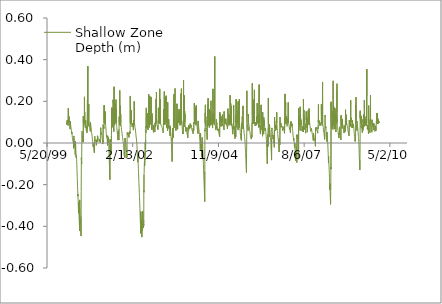
| Category | Shallow Zone Depth (m) |
|---|---|
| 36526.0 | 0.1 |
| 36527.0 | 0.097 |
| 36528.0 | 0.095 |
| 36529.0 | 0.092 |
| 36530.0 | 0.091 |
| 36531.0 | 0.089 |
| 36532.0 | 0.087 |
| 36533.0 | 0.095 |
| 36534.0 | 0.093 |
| 36535.0 | 0.09 |
| 36536.0 | 0.109 |
| 36537.0 | 0.101 |
| 36538.0 | 0.098 |
| 36539.0 | 0.098 |
| 36540.0 | 0.095 |
| 36541.0 | 0.093 |
| 36542.0 | 0.091 |
| 36543.0 | 0.089 |
| 36544.0 | 0.086 |
| 36545.0 | 0.086 |
| 36546.0 | 0.084 |
| 36547.0 | 0.082 |
| 36548.0 | 0.08 |
| 36549.0 | 0.167 |
| 36550.0 | 0.149 |
| 36551.0 | 0.109 |
| 36552.0 | 0.108 |
| 36553.0 | 0.101 |
| 36554.0 | 0.117 |
| 36555.0 | 0.099 |
| 36556.0 | 0.128 |
| 36557.0 | 0.105 |
| 36558.0 | 0.1 |
| 36559.0 | 0.098 |
| 36560.0 | 0.095 |
| 36561.0 | 0.092 |
| 36562.0 | 0.09 |
| 36563.0 | 0.087 |
| 36564.0 | 0.084 |
| 36565.0 | 0.082 |
| 36566.0 | 0.079 |
| 36567.0 | 0.076 |
| 36568.0 | 0.073 |
| 36569.0 | 0.07 |
| 36570.0 | 0.067 |
| 36571.0 | 0.105 |
| 36572.0 | 0.099 |
| 36573.0 | 0.095 |
| 36574.0 | 0.092 |
| 36575.0 | 0.088 |
| 36576.0 | 0.085 |
| 36577.0 | 0.082 |
| 36578.0 | 0.079 |
| 36579.0 | 0.076 |
| 36580.0 | 0.073 |
| 36581.0 | 0.07 |
| 36582.0 | 0.066 |
| 36583.0 | 0.063 |
| 36584.0 | 0.064 |
| 36585.0 | 0.061 |
| 36586.0 | 0.057 |
| 36587.0 | 0.053 |
| 36588.0 | 0.049 |
| 36589.0 | 0.045 |
| 36590.0 | 0.052 |
| 36591.0 | 0.049 |
| 36592.0 | 0.044 |
| 36593.0 | 0.04 |
| 36594.0 | 0.035 |
| 36595.0 | 0.031 |
| 36596.0 | 0.027 |
| 36597.0 | 0.024 |
| 36598.0 | 0.024 |
| 36599.0 | 0.02 |
| 36600.0 | 0.016 |
| 36601.0 | 0.011 |
| 36602.0 | 0.013 |
| 36603.0 | 0.009 |
| 36604.0 | 0.007 |
| 36605.0 | 0.009 |
| 36606.0 | 0.008 |
| 36607.0 | 0.004 |
| 36608.0 | -0.001 |
| 36609.0 | -0.008 |
| 36610.0 | -0.016 |
| 36611.0 | -0.026 |
| 36612.0 | 0.022 |
| 36613.0 | 0.034 |
| 36614.0 | 0.032 |
| 36615.0 | 0.027 |
| 36616.0 | 0.024 |
| 36617.0 | 0.02 |
| 36618.0 | 0.016 |
| 36619.0 | 0.011 |
| 36620.0 | 0.007 |
| 36621.0 | 0.007 |
| 36622.0 | 0.002 |
| 36623.0 | -0.005 |
| 36624.0 | -0.016 |
| 36625.0 | -0.006 |
| 36626.0 | -0.014 |
| 36627.0 | -0.025 |
| 36628.0 | -0.036 |
| 36629.0 | -0.046 |
| 36630.0 | -0.057 |
| 36631.0 | 0.009 |
| 36632.0 | 0.008 |
| 36633.0 | 0.002 |
| 36634.0 | -0.005 |
| 36635.0 | -0.015 |
| 36636.0 | -0.026 |
| 36637.0 | -0.037 |
| 36638.0 | -0.047 |
| 36639.0 | -0.056 |
| 36640.0 | -0.067 |
| 36641.0 | -0.06 |
| 36642.0 | -0.069 |
| 36643.0 | -0.061 |
| 36644.0 | -0.072 |
| 36645.0 | -0.068 |
| 36646.0 | -0.078 |
| 36647.0 | -0.09 |
| 36648.0 | -0.103 |
| 36649.0 | -0.116 |
| 36650.0 | -0.128 |
| 36651.0 | -0.14 |
| 36652.0 | -0.152 |
| 36653.0 | -0.164 |
| 36654.0 | -0.177 |
| 36655.0 | -0.191 |
| 36656.0 | -0.204 |
| 36657.0 | -0.215 |
| 36658.0 | -0.228 |
| 36659.0 | -0.241 |
| 36660.0 | -0.254 |
| 36661.0 | -0.245 |
| 36662.0 | -0.258 |
| 36663.0 | -0.269 |
| 36664.0 | -0.283 |
| 36665.0 | -0.296 |
| 36666.0 | -0.311 |
| 36667.0 | -0.324 |
| 36668.0 | -0.337 |
| 36669.0 | -0.285 |
| 36670.0 | -0.297 |
| 36671.0 | -0.308 |
| 36672.0 | -0.32 |
| 36673.0 | -0.332 |
| 36674.0 | -0.346 |
| 36675.0 | -0.359 |
| 36676.0 | -0.37 |
| 36677.0 | -0.381 |
| 36678.0 | -0.393 |
| 36679.0 | -0.408 |
| 36680.0 | -0.422 |
| 36681.0 | -0.273 |
| 36682.0 | -0.287 |
| 36683.0 | -0.3 |
| 36684.0 | -0.31 |
| 36685.0 | -0.322 |
| 36686.0 | -0.335 |
| 36687.0 | -0.348 |
| 36688.0 | -0.361 |
| 36689.0 | -0.365 |
| 36690.0 | -0.367 |
| 36691.0 | -0.378 |
| 36692.0 | -0.389 |
| 36693.0 | -0.4 |
| 36694.0 | -0.412 |
| 36695.0 | -0.422 |
| 36696.0 | -0.433 |
| 36697.0 | -0.447 |
| 36698.0 | -0.352 |
| 36699.0 | -0.232 |
| 36700.0 | -0.145 |
| 36701.0 | -0.071 |
| 36702.0 | -0.081 |
| 36703.0 | -0.093 |
| 36704.0 | -0.101 |
| 36705.0 | -0.09 |
| 36706.0 | 0 |
| 36707.0 | 0.021 |
| 36708.0 | 0.056 |
| 36709.0 | 0.05 |
| 36710.0 | 0.044 |
| 36711.0 | 0.038 |
| 36712.0 | 0.032 |
| 36713.0 | 0.025 |
| 36714.0 | 0.018 |
| 36715.0 | 0.031 |
| 36716.0 | 0.025 |
| 36717.0 | 0.019 |
| 36718.0 | 0.012 |
| 36719.0 | 0.005 |
| 36720.0 | 0.016 |
| 36721.0 | 0.011 |
| 36722.0 | 0.007 |
| 36723.0 | 0.004 |
| 36724.0 | 0.129 |
| 36725.0 | 0.096 |
| 36726.0 | 0.09 |
| 36727.0 | 0.083 |
| 36728.0 | 0.091 |
| 36729.0 | 0.087 |
| 36730.0 | 0.119 |
| 36731.0 | 0.1 |
| 36732.0 | 0.098 |
| 36733.0 | 0.116 |
| 36734.0 | 0.096 |
| 36735.0 | 0.102 |
| 36736.0 | 0.097 |
| 36737.0 | 0.222 |
| 36738.0 | 0.095 |
| 36739.0 | 0.1 |
| 36740.0 | 0.149 |
| 36741.0 | 0.095 |
| 36742.0 | 0.099 |
| 36743.0 | 0.096 |
| 36744.0 | 0.09 |
| 36745.0 | 0.086 |
| 36746.0 | 0.08 |
| 36747.0 | 0.074 |
| 36748.0 | 0.094 |
| 36749.0 | 0.089 |
| 36750.0 | 0.084 |
| 36751.0 | 0.108 |
| 36752.0 | 0.097 |
| 36753.0 | 0.092 |
| 36754.0 | 0.085 |
| 36755.0 | 0.079 |
| 36756.0 | 0.073 |
| 36757.0 | 0.067 |
| 36758.0 | 0.068 |
| 36759.0 | 0.063 |
| 36760.0 | 0.058 |
| 36761.0 | 0.08 |
| 36762.0 | 0.074 |
| 36763.0 | 0.068 |
| 36764.0 | 0.066 |
| 36765.0 | 0.06 |
| 36766.0 | 0.054 |
| 36767.0 | 0.049 |
| 36768.0 | 0.078 |
| 36769.0 | 0.076 |
| 36770.0 | 0.07 |
| 36771.0 | 0.069 |
| 36772.0 | 0.208 |
| 36773.0 | 0.107 |
| 36774.0 | 0.1 |
| 36775.0 | 0.104 |
| 36776.0 | 0.369 |
| 36777.0 | 0.096 |
| 36778.0 | 0.104 |
| 36779.0 | 0.108 |
| 36780.0 | 0.099 |
| 36781.0 | 0.095 |
| 36782.0 | 0.09 |
| 36783.0 | 0.085 |
| 36784.0 | 0.08 |
| 36785.0 | 0.078 |
| 36786.0 | 0.083 |
| 36787.0 | 0.187 |
| 36788.0 | 0.098 |
| 36789.0 | 0.094 |
| 36790.0 | 0.1 |
| 36791.0 | 0.096 |
| 36792.0 | 0.094 |
| 36793.0 | 0.091 |
| 36794.0 | 0.088 |
| 36795.0 | 0.088 |
| 36796.0 | 0.085 |
| 36797.0 | 0.082 |
| 36798.0 | 0.078 |
| 36799.0 | 0.079 |
| 36800.0 | 0.075 |
| 36801.0 | 0.072 |
| 36802.0 | 0.068 |
| 36803.0 | 0.064 |
| 36804.0 | 0.06 |
| 36805.0 | 0.056 |
| 36806.0 | 0.101 |
| 36807.0 | 0.098 |
| 36808.0 | 0.095 |
| 36809.0 | 0.092 |
| 36810.0 | 0.089 |
| 36811.0 | 0.086 |
| 36812.0 | 0.082 |
| 36813.0 | 0.079 |
| 36814.0 | 0.075 |
| 36815.0 | 0.071 |
| 36816.0 | 0.067 |
| 36817.0 | 0.063 |
| 36818.0 | 0.059 |
| 36819.0 | 0.055 |
| 36820.0 | 0.052 |
| 36821.0 | 0.049 |
| 36822.0 | 0.045 |
| 36823.0 | 0.042 |
| 36824.0 | 0.041 |
| 36825.0 | 0.037 |
| 36826.0 | 0.034 |
| 36827.0 | 0.03 |
| 36828.0 | 0.026 |
| 36829.0 | 0.022 |
| 36830.0 | 0.019 |
| 36831.0 | 0.015 |
| 36832.0 | 0.012 |
| 36833.0 | 0.009 |
| 36834.0 | 0.006 |
| 36835.0 | 0.002 |
| 36836.0 | -0.001 |
| 36837.0 | -0.007 |
| 36838.0 | -0.013 |
| 36839.0 | -0.018 |
| 36840.0 | -0.001 |
| 36841.0 | -0.005 |
| 36842.0 | -0.01 |
| 36843.0 | -0.016 |
| 36844.0 | -0.022 |
| 36845.0 | -0.026 |
| 36846.0 | -0.031 |
| 36847.0 | -0.037 |
| 36848.0 | -0.042 |
| 36849.0 | -0.045 |
| 36850.0 | -0.037 |
| 36851.0 | -0.04 |
| 36852.0 | -0.043 |
| 36853.0 | -0.047 |
| 36854.0 | -0.052 |
| 36855.0 | -0.007 |
| 36856.0 | 0.023 |
| 36857.0 | 0.032 |
| 36858.0 | 0.03 |
| 36859.0 | 0.027 |
| 36860.0 | 0.025 |
| 36861.0 | 0.023 |
| 36862.0 | 0.02 |
| 36863.0 | 0.018 |
| 36864.0 | 0.016 |
| 36865.0 | 0.015 |
| 36866.0 | 0.013 |
| 36867.0 | 0.011 |
| 36868.0 | 0.009 |
| 36869.0 | 0.006 |
| 36870.0 | 0.004 |
| 36871.0 | 0.002 |
| 36872.0 | 0.004 |
| 36873.0 | 0.002 |
| 36874.0 | -0.002 |
| 36875.0 | -0.006 |
| 36876.0 | -0.011 |
| 36877.0 | 0.016 |
| 36878.0 | 0.019 |
| 36879.0 | 0.018 |
| 36880.0 | 0.019 |
| 36881.0 | 0.018 |
| 36882.0 | 0.016 |
| 36883.0 | 0.014 |
| 36884.0 | 0.012 |
| 36885.0 | 0.011 |
| 36886.0 | 0.009 |
| 36887.0 | 0.007 |
| 36888.0 | 0.005 |
| 36889.0 | 0.035 |
| 36890.0 | 0.033 |
| 36891.0 | 0.032 |
| 36892.0 | 0.031 |
| 36893.0 | 0.03 |
| 36894.0 | 0.028 |
| 36895.0 | 0.027 |
| 36896.0 | 0.025 |
| 36897.0 | 0.023 |
| 36898.0 | 0.021 |
| 36899.0 | 0.019 |
| 36900.0 | 0.019 |
| 36901.0 | 0.018 |
| 36902.0 | 0.016 |
| 36903.0 | 0.016 |
| 36904.0 | 0.021 |
| 36905.0 | 0.019 |
| 36906.0 | 0.017 |
| 36907.0 | 0.014 |
| 36908.0 | 0.011 |
| 36909.0 | 0.009 |
| 36910.0 | 0.007 |
| 36911.0 | 0.004 |
| 36912.0 | 0.019 |
| 36913.0 | 0.018 |
| 36914.0 | 0.016 |
| 36915.0 | 0.014 |
| 36916.0 | 0.012 |
| 36917.0 | 0.01 |
| 36918.0 | 0.008 |
| 36919.0 | 0.005 |
| 36920.0 | 0.002 |
| 36921.0 | -0.001 |
| 36922.0 | 0.014 |
| 36923.0 | 0.034 |
| 36924.0 | 0.043 |
| 36925.0 | 0.059 |
| 36926.0 | 0.057 |
| 36927.0 | 0.073 |
| 36928.0 | 0.071 |
| 36929.0 | 0.068 |
| 36930.0 | 0.065 |
| 36931.0 | 0.061 |
| 36932.0 | 0.058 |
| 36933.0 | 0.055 |
| 36934.0 | 0.052 |
| 36935.0 | 0.049 |
| 36936.0 | 0.046 |
| 36937.0 | 0.043 |
| 36938.0 | 0.04 |
| 36939.0 | 0.036 |
| 36940.0 | 0.033 |
| 36941.0 | 0.03 |
| 36942.0 | 0.027 |
| 36943.0 | 0.023 |
| 36944.0 | 0.019 |
| 36945.0 | 0.016 |
| 36946.0 | 0.014 |
| 36947.0 | 0.011 |
| 36948.0 | 0.008 |
| 36949.0 | 0.005 |
| 36950.0 | 0.001 |
| 36951.0 | -0.005 |
| 36952.0 | 0.012 |
| 36953.0 | 0.009 |
| 36954.0 | 0.006 |
| 36955.0 | 0.088 |
| 36956.0 | 0.085 |
| 36957.0 | 0.082 |
| 36958.0 | 0.079 |
| 36959.0 | 0.075 |
| 36960.0 | 0.08 |
| 36961.0 | 0.077 |
| 36962.0 | 0.073 |
| 36963.0 | 0.068 |
| 36964.0 | 0.085 |
| 36965.0 | 0.081 |
| 36966.0 | 0.181 |
| 36967.0 | 0.115 |
| 36968.0 | 0.098 |
| 36969.0 | 0.148 |
| 36970.0 | 0.182 |
| 36971.0 | 0.125 |
| 36972.0 | 0.098 |
| 36973.0 | 0.094 |
| 36974.0 | 0.09 |
| 36975.0 | 0.086 |
| 36976.0 | 0.113 |
| 36977.0 | 0.098 |
| 36978.0 | 0.095 |
| 36979.0 | 0.092 |
| 36980.0 | 0.151 |
| 36981.0 | 0.099 |
| 36982.0 | 0.095 |
| 36983.0 | 0.091 |
| 36984.0 | 0.086 |
| 36985.0 | 0.08 |
| 36986.0 | 0.076 |
| 36987.0 | 0.072 |
| 36988.0 | 0.066 |
| 36989.0 | 0.061 |
| 36990.0 | 0.055 |
| 36991.0 | 0.05 |
| 36992.0 | 0.045 |
| 36993.0 | 0.039 |
| 36994.0 | 0.033 |
| 36995.0 | 0.028 |
| 36996.0 | 0.03 |
| 36997.0 | 0.038 |
| 36998.0 | 0.034 |
| 36999.0 | 0.029 |
| 37000.0 | 0.026 |
| 37001.0 | 0.021 |
| 37002.0 | 0.016 |
| 37003.0 | 0.011 |
| 37004.0 | 0.005 |
| 37005.0 | -0.001 |
| 37006.0 | -0.012 |
| 37007.0 | 0.033 |
| 37008.0 | 0.029 |
| 37009.0 | 0.024 |
| 37010.0 | 0.018 |
| 37011.0 | 0.013 |
| 37012.0 | 0.009 |
| 37013.0 | 0.004 |
| 37014.0 | 0.027 |
| 37015.0 | 0.022 |
| 37016.0 | 0.017 |
| 37017.0 | 0.011 |
| 37018.0 | 0.005 |
| 37019.0 | 0.003 |
| 37020.0 | -0.003 |
| 37021.0 | -0.013 |
| 37022.0 | -0.024 |
| 37023.0 | -0.037 |
| 37024.0 | -0.048 |
| 37025.0 | -0.061 |
| 37026.0 | -0.074 |
| 37027.0 | -0.086 |
| 37028.0 | -0.1 |
| 37029.0 | -0.112 |
| 37030.0 | -0.125 |
| 37031.0 | -0.138 |
| 37032.0 | -0.149 |
| 37033.0 | -0.163 |
| 37034.0 | -0.176 |
| 37035.0 | 0.017 |
| 37036.0 | 0.01 |
| 37037.0 | 0.003 |
| 37038.0 | -0.007 |
| 37039.0 | -0.021 |
| 37040.0 | -0.025 |
| 37041.0 | -0.024 |
| 37042.0 | -0.007 |
| 37043.0 | -0.019 |
| 37044.0 | -0.018 |
| 37045.0 | -0.029 |
| 37046.0 | -0.042 |
| 37047.0 | -0.055 |
| 37048.0 | -0.001 |
| 37049.0 | 0.011 |
| 37050.0 | 0.006 |
| 37051.0 | 0.005 |
| 37052.0 | 0.036 |
| 37053.0 | 0.109 |
| 37054.0 | 0.143 |
| 37055.0 | 0.17 |
| 37056.0 | 0.095 |
| 37057.0 | 0.122 |
| 37058.0 | 0.094 |
| 37059.0 | 0.088 |
| 37060.0 | 0.081 |
| 37061.0 | 0.086 |
| 37062.0 | 0.079 |
| 37063.0 | 0.079 |
| 37064.0 | 0.076 |
| 37065.0 | 0.117 |
| 37066.0 | 0.169 |
| 37067.0 | 0.095 |
| 37068.0 | 0.089 |
| 37069.0 | 0.101 |
| 37070.0 | 0.207 |
| 37071.0 | 0.191 |
| 37072.0 | 0.133 |
| 37073.0 | 0.095 |
| 37074.0 | 0.09 |
| 37075.0 | 0.084 |
| 37076.0 | 0.078 |
| 37077.0 | 0.073 |
| 37078.0 | 0.067 |
| 37079.0 | 0.061 |
| 37080.0 | 0.055 |
| 37081.0 | 0.103 |
| 37082.0 | 0.096 |
| 37083.0 | 0.27 |
| 37084.0 | 0.128 |
| 37085.0 | 0.097 |
| 37086.0 | 0.137 |
| 37087.0 | 0.097 |
| 37088.0 | 0.092 |
| 37089.0 | 0.086 |
| 37090.0 | 0.096 |
| 37091.0 | 0.138 |
| 37092.0 | 0.095 |
| 37093.0 | 0.192 |
| 37094.0 | 0.096 |
| 37095.0 | 0.095 |
| 37096.0 | 0.102 |
| 37097.0 | 0.105 |
| 37098.0 | 0.098 |
| 37099.0 | 0.105 |
| 37100.0 | 0.114 |
| 37101.0 | 0.096 |
| 37102.0 | 0.136 |
| 37103.0 | 0.098 |
| 37104.0 | 0.172 |
| 37105.0 | 0.208 |
| 37106.0 | 0.099 |
| 37107.0 | 0.1 |
| 37108.0 | 0.096 |
| 37109.0 | 0.163 |
| 37110.0 | 0.095 |
| 37111.0 | 0.09 |
| 37112.0 | 0.085 |
| 37113.0 | 0.079 |
| 37114.0 | 0.074 |
| 37115.0 | 0.069 |
| 37116.0 | 0.068 |
| 37117.0 | 0.062 |
| 37118.0 | 0.059 |
| 37119.0 | 0.056 |
| 37120.0 | 0.05 |
| 37121.0 | 0.045 |
| 37122.0 | 0.039 |
| 37123.0 | 0.042 |
| 37124.0 | 0.037 |
| 37125.0 | 0.031 |
| 37126.0 | 0.026 |
| 37127.0 | 0.02 |
| 37128.0 | 0.014 |
| 37129.0 | 0.056 |
| 37130.0 | 0.051 |
| 37131.0 | 0.045 |
| 37132.0 | 0.039 |
| 37133.0 | 0.034 |
| 37134.0 | 0.028 |
| 37135.0 | 0.03 |
| 37136.0 | 0.025 |
| 37137.0 | 0.021 |
| 37138.0 | 0.018 |
| 37139.0 | 0.014 |
| 37140.0 | 0.067 |
| 37141.0 | 0.071 |
| 37142.0 | 0.127 |
| 37143.0 | 0.096 |
| 37144.0 | 0.092 |
| 37145.0 | 0.088 |
| 37146.0 | 0.095 |
| 37147.0 | 0.112 |
| 37148.0 | 0.126 |
| 37149.0 | 0.252 |
| 37150.0 | 0.144 |
| 37151.0 | 0.095 |
| 37152.0 | 0.091 |
| 37153.0 | 0.09 |
| 37154.0 | 0.086 |
| 37155.0 | 0.082 |
| 37156.0 | 0.079 |
| 37157.0 | 0.179 |
| 37158.0 | 0.097 |
| 37159.0 | 0.102 |
| 37160.0 | 0.139 |
| 37161.0 | 0.096 |
| 37162.0 | 0.093 |
| 37163.0 | 0.089 |
| 37164.0 | 0.085 |
| 37165.0 | 0.082 |
| 37166.0 | 0.078 |
| 37167.0 | 0.074 |
| 37168.0 | 0.07 |
| 37169.0 | 0.066 |
| 37170.0 | 0.062 |
| 37171.0 | 0.059 |
| 37172.0 | 0.057 |
| 37173.0 | 0.053 |
| 37174.0 | 0.05 |
| 37175.0 | 0.047 |
| 37176.0 | 0.046 |
| 37177.0 | 0.042 |
| 37178.0 | 0.039 |
| 37179.0 | 0.036 |
| 37180.0 | 0.033 |
| 37181.0 | 0.029 |
| 37182.0 | 0.026 |
| 37183.0 | 0.022 |
| 37184.0 | 0.019 |
| 37185.0 | 0.015 |
| 37186.0 | 0.012 |
| 37187.0 | 0.009 |
| 37188.0 | 0.006 |
| 37189.0 | 0.009 |
| 37190.0 | 0.005 |
| 37191.0 | 0.001 |
| 37192.0 | -0.003 |
| 37193.0 | -0.009 |
| 37194.0 | -0.015 |
| 37195.0 | -0.021 |
| 37196.0 | -0.028 |
| 37197.0 | -0.036 |
| 37198.0 | -0.041 |
| 37199.0 | -0.046 |
| 37200.0 | -0.05 |
| 37201.0 | -0.055 |
| 37202.0 | -0.06 |
| 37203.0 | -0.043 |
| 37204.0 | -0.049 |
| 37205.0 | -0.055 |
| 37206.0 | -0.06 |
| 37207.0 | -0.066 |
| 37208.0 | -0.072 |
| 37209.0 | -0.073 |
| 37210.0 | 0.023 |
| 37211.0 | 0.021 |
| 37212.0 | 0.019 |
| 37213.0 | 0.016 |
| 37214.0 | 0.013 |
| 37215.0 | 0.011 |
| 37216.0 | 0.008 |
| 37217.0 | 0.005 |
| 37218.0 | 0.003 |
| 37219.0 | 0.003 |
| 37220.0 | 0 |
| 37221.0 | -0.006 |
| 37222.0 | -0.012 |
| 37223.0 | -0.017 |
| 37224.0 | -0.023 |
| 37225.0 | -0.029 |
| 37226.0 | -0.034 |
| 37227.0 | -0.039 |
| 37228.0 | -0.044 |
| 37229.0 | -0.049 |
| 37230.0 | -0.053 |
| 37231.0 | -0.058 |
| 37232.0 | -0.063 |
| 37233.0 | -0.068 |
| 37234.0 | -0.052 |
| 37235.0 | 0.05 |
| 37236.0 | 0.053 |
| 37237.0 | 0.051 |
| 37238.0 | 0.049 |
| 37239.0 | 0.047 |
| 37240.0 | 0.045 |
| 37241.0 | 0.043 |
| 37242.0 | 0.041 |
| 37243.0 | 0.038 |
| 37244.0 | 0.05 |
| 37245.0 | 0.048 |
| 37246.0 | 0.046 |
| 37247.0 | 0.044 |
| 37248.0 | 0.042 |
| 37249.0 | 0.039 |
| 37250.0 | 0.037 |
| 37251.0 | 0.036 |
| 37252.0 | 0.035 |
| 37253.0 | 0.033 |
| 37254.0 | 0.031 |
| 37255.0 | 0.029 |
| 37256.0 | 0.027 |
| 37257.0 | 0.025 |
| 37258.0 | 0.023 |
| 37259.0 | 0.046 |
| 37260.0 | 0.045 |
| 37261.0 | 0.044 |
| 37262.0 | 0.042 |
| 37263.0 | 0.054 |
| 37264.0 | 0.053 |
| 37265.0 | 0.051 |
| 37266.0 | 0.049 |
| 37267.0 | 0.047 |
| 37268.0 | 0.044 |
| 37269.0 | 0.043 |
| 37270.0 | 0.055 |
| 37271.0 | 0.226 |
| 37272.0 | 0.098 |
| 37273.0 | 0.096 |
| 37274.0 | 0.093 |
| 37275.0 | 0.091 |
| 37276.0 | 0.093 |
| 37277.0 | 0.09 |
| 37278.0 | 0.119 |
| 37279.0 | 0.099 |
| 37280.0 | 0.096 |
| 37281.0 | 0.094 |
| 37282.0 | 0.137 |
| 37283.0 | 0.1 |
| 37284.0 | 0.098 |
| 37285.0 | 0.159 |
| 37286.0 | 0.098 |
| 37287.0 | 0.096 |
| 37288.0 | 0.094 |
| 37289.0 | 0.091 |
| 37290.0 | 0.088 |
| 37291.0 | 0.085 |
| 37292.0 | 0.083 |
| 37293.0 | 0.081 |
| 37294.0 | 0.078 |
| 37295.0 | 0.096 |
| 37296.0 | 0.093 |
| 37297.0 | 0.09 |
| 37298.0 | 0.088 |
| 37299.0 | 0.085 |
| 37300.0 | 0.082 |
| 37301.0 | 0.082 |
| 37302.0 | 0.079 |
| 37303.0 | 0.076 |
| 37304.0 | 0.074 |
| 37305.0 | 0.071 |
| 37306.0 | 0.068 |
| 37307.0 | 0.065 |
| 37308.0 | 0.062 |
| 37309.0 | 0.062 |
| 37310.0 | 0.06 |
| 37311.0 | 0.11 |
| 37312.0 | 0.1 |
| 37313.0 | 0.096 |
| 37314.0 | 0.093 |
| 37315.0 | 0.091 |
| 37316.0 | 0.089 |
| 37317.0 | 0.086 |
| 37318.0 | 0.199 |
| 37319.0 | 0.196 |
| 37320.0 | 0.098 |
| 37321.0 | 0.095 |
| 37322.0 | 0.091 |
| 37323.0 | 0.087 |
| 37324.0 | 0.083 |
| 37325.0 | 0.079 |
| 37326.0 | 0.075 |
| 37327.0 | 0.071 |
| 37328.0 | 0.077 |
| 37329.0 | 0.076 |
| 37330.0 | 0.073 |
| 37331.0 | 0.068 |
| 37332.0 | 0.063 |
| 37333.0 | 0.059 |
| 37334.0 | 0.054 |
| 37335.0 | 0.049 |
| 37336.0 | 0.045 |
| 37337.0 | 0.041 |
| 37338.0 | 0.038 |
| 37339.0 | 0.034 |
| 37340.0 | 0.029 |
| 37341.0 | 0.026 |
| 37342.0 | 0.022 |
| 37343.0 | 0.02 |
| 37344.0 | 0.015 |
| 37345.0 | 0.01 |
| 37346.0 | 0.006 |
| 37347.0 | 0.002 |
| 37348.0 | 0 |
| 37349.0 | -0.009 |
| 37350.0 | -0.015 |
| 37351.0 | -0.024 |
| 37352.0 | -0.033 |
| 37353.0 | -0.042 |
| 37354.0 | -0.052 |
| 37355.0 | -0.062 |
| 37356.0 | -0.072 |
| 37357.0 | -0.076 |
| 37358.0 | -0.084 |
| 37359.0 | -0.092 |
| 37360.0 | -0.058 |
| 37361.0 | -0.067 |
| 37362.0 | -0.077 |
| 37363.0 | -0.088 |
| 37364.0 | -0.099 |
| 37365.0 | -0.11 |
| 37366.0 | -0.122 |
| 37367.0 | -0.131 |
| 37368.0 | -0.142 |
| 37369.0 | -0.153 |
| 37370.0 | -0.163 |
| 37371.0 | -0.175 |
| 37372.0 | -0.184 |
| 37373.0 | -0.195 |
| 37374.0 | -0.206 |
| 37375.0 | -0.216 |
| 37376.0 | -0.226 |
| 37377.0 | -0.236 |
| 37378.0 | -0.246 |
| 37379.0 | -0.257 |
| 37380.0 | -0.268 |
| 37381.0 | -0.281 |
| 37382.0 | -0.291 |
| 37383.0 | -0.302 |
| 37384.0 | -0.315 |
| 37385.0 | -0.327 |
| 37386.0 | -0.34 |
| 37387.0 | -0.352 |
| 37388.0 | -0.364 |
| 37389.0 | -0.377 |
| 37390.0 | -0.387 |
| 37391.0 | -0.396 |
| 37392.0 | -0.408 |
| 37393.0 | -0.422 |
| 37394.0 | -0.434 |
| 37395.0 | -0.33 |
| 37396.0 | -0.331 |
| 37397.0 | -0.34 |
| 37398.0 | -0.35 |
| 37399.0 | -0.361 |
| 37400.0 | -0.371 |
| 37401.0 | -0.384 |
| 37402.0 | -0.396 |
| 37403.0 | -0.409 |
| 37404.0 | -0.42 |
| 37405.0 | -0.432 |
| 37406.0 | -0.443 |
| 37407.0 | -0.452 |
| 37408.0 | -0.368 |
| 37409.0 | -0.382 |
| 37410.0 | -0.394 |
| 37411.0 | -0.398 |
| 37412.0 | -0.41 |
| 37413.0 | -0.422 |
| 37414.0 | -0.384 |
| 37415.0 | -0.39 |
| 37416.0 | -0.328 |
| 37417.0 | -0.334 |
| 37418.0 | -0.338 |
| 37419.0 | -0.347 |
| 37420.0 | -0.359 |
| 37421.0 | -0.371 |
| 37422.0 | -0.384 |
| 37423.0 | -0.395 |
| 37424.0 | -0.408 |
| 37425.0 | -0.403 |
| 37426.0 | -0.404 |
| 37427.0 | -0.389 |
| 37428.0 | -0.398 |
| 37429.0 | -0.369 |
| 37430.0 | -0.229 |
| 37431.0 | -0.236 |
| 37432.0 | -0.153 |
| 37433.0 | -0.146 |
| 37434.0 | -0.15 |
| 37435.0 | -0.151 |
| 37436.0 | -0.097 |
| 37437.0 | -0.088 |
| 37438.0 | -0.095 |
| 37439.0 | -0.098 |
| 37440.0 | -0.109 |
| 37441.0 | -0.075 |
| 37442.0 | -0.08 |
| 37443.0 | -0.06 |
| 37444.0 | -0.047 |
| 37445.0 | -0.059 |
| 37446.0 | 0.002 |
| 37447.0 | 0.002 |
| 37448.0 | -0.007 |
| 37449.0 | -0.019 |
| 37450.0 | -0.028 |
| 37451.0 | 0.015 |
| 37452.0 | 0.06 |
| 37453.0 | 0.055 |
| 37454.0 | 0.049 |
| 37455.0 | 0.08 |
| 37456.0 | 0.075 |
| 37457.0 | 0.12 |
| 37458.0 | 0.169 |
| 37459.0 | 0.114 |
| 37460.0 | 0.096 |
| 37461.0 | 0.091 |
| 37462.0 | 0.086 |
| 37463.0 | 0.081 |
| 37464.0 | 0.078 |
| 37465.0 | 0.072 |
| 37466.0 | 0.071 |
| 37467.0 | 0.082 |
| 37468.0 | 0.076 |
| 37469.0 | 0.07 |
| 37470.0 | 0.088 |
| 37471.0 | 0.098 |
| 37472.0 | 0.142 |
| 37473.0 | 0.119 |
| 37474.0 | 0.095 |
| 37475.0 | 0.09 |
| 37476.0 | 0.084 |
| 37477.0 | 0.079 |
| 37478.0 | 0.073 |
| 37479.0 | 0.068 |
| 37480.0 | 0.062 |
| 37481.0 | 0.11 |
| 37482.0 | 0.104 |
| 37483.0 | 0.096 |
| 37484.0 | 0.159 |
| 37485.0 | 0.096 |
| 37486.0 | 0.127 |
| 37487.0 | 0.234 |
| 37488.0 | 0.096 |
| 37489.0 | 0.092 |
| 37490.0 | 0.098 |
| 37491.0 | 0.092 |
| 37492.0 | 0.086 |
| 37493.0 | 0.08 |
| 37494.0 | 0.075 |
| 37495.0 | 0.073 |
| 37496.0 | 0.185 |
| 37497.0 | 0.096 |
| 37498.0 | 0.157 |
| 37499.0 | 0.226 |
| 37500.0 | 0.096 |
| 37501.0 | 0.092 |
| 37502.0 | 0.088 |
| 37503.0 | 0.083 |
| 37504.0 | 0.084 |
| 37505.0 | 0.124 |
| 37506.0 | 0.096 |
| 37507.0 | 0.091 |
| 37508.0 | 0.102 |
| 37509.0 | 0.097 |
| 37510.0 | 0.092 |
| 37511.0 | 0.088 |
| 37512.0 | 0.125 |
| 37513.0 | 0.098 |
| 37514.0 | 0.221 |
| 37515.0 | 0.099 |
| 37516.0 | 0.095 |
| 37517.0 | 0.09 |
| 37518.0 | 0.085 |
| 37519.0 | 0.081 |
| 37520.0 | 0.076 |
| 37521.0 | 0.073 |
| 37522.0 | 0.068 |
| 37523.0 | 0.063 |
| 37524.0 | 0.143 |
| 37525.0 | 0.101 |
| 37526.0 | 0.131 |
| 37527.0 | 0.096 |
| 37528.0 | 0.091 |
| 37529.0 | 0.086 |
| 37530.0 | 0.082 |
| 37531.0 | 0.084 |
| 37532.0 | 0.079 |
| 37533.0 | 0.075 |
| 37534.0 | 0.071 |
| 37535.0 | 0.067 |
| 37536.0 | 0.063 |
| 37537.0 | 0.059 |
| 37538.0 | 0.064 |
| 37539.0 | 0.062 |
| 37540.0 | 0.061 |
| 37541.0 | 0.058 |
| 37542.0 | 0.054 |
| 37543.0 | 0.051 |
| 37544.0 | 0.054 |
| 37545.0 | 0.086 |
| 37546.0 | 0.083 |
| 37547.0 | 0.08 |
| 37548.0 | 0.077 |
| 37549.0 | 0.073 |
| 37550.0 | 0.069 |
| 37551.0 | 0.065 |
| 37552.0 | 0.061 |
| 37553.0 | 0.058 |
| 37554.0 | 0.065 |
| 37555.0 | 0.063 |
| 37556.0 | 0.06 |
| 37557.0 | 0.057 |
| 37558.0 | 0.053 |
| 37559.0 | 0.052 |
| 37560.0 | 0.096 |
| 37561.0 | 0.094 |
| 37562.0 | 0.09 |
| 37563.0 | 0.088 |
| 37564.0 | 0.085 |
| 37565.0 | 0.082 |
| 37566.0 | 0.079 |
| 37567.0 | 0.096 |
| 37568.0 | 0.094 |
| 37569.0 | 0.091 |
| 37570.0 | 0.088 |
| 37571.0 | 0.123 |
| 37572.0 | 0.098 |
| 37573.0 | 0.211 |
| 37574.0 | 0.125 |
| 37575.0 | 0.097 |
| 37576.0 | 0.095 |
| 37577.0 | 0.245 |
| 37578.0 | 0.117 |
| 37579.0 | 0.098 |
| 37580.0 | 0.095 |
| 37581.0 | 0.093 |
| 37582.0 | 0.091 |
| 37583.0 | 0.089 |
| 37584.0 | 0.087 |
| 37585.0 | 0.085 |
| 37586.0 | 0.082 |
| 37587.0 | 0.08 |
| 37588.0 | 0.077 |
| 37589.0 | 0.075 |
| 37590.0 | 0.073 |
| 37591.0 | 0.071 |
| 37592.0 | 0.068 |
| 37593.0 | 0.066 |
| 37594.0 | 0.064 |
| 37595.0 | 0.061 |
| 37596.0 | 0.086 |
| 37597.0 | 0.106 |
| 37598.0 | 0.101 |
| 37599.0 | 0.099 |
| 37600.0 | 0.169 |
| 37601.0 | 0.127 |
| 37602.0 | 0.098 |
| 37603.0 | 0.116 |
| 37604.0 | 0.137 |
| 37605.0 | 0.099 |
| 37606.0 | 0.097 |
| 37607.0 | 0.095 |
| 37608.0 | 0.093 |
| 37609.0 | 0.091 |
| 37610.0 | 0.089 |
| 37611.0 | 0.1 |
| 37612.0 | 0.098 |
| 37613.0 | 0.096 |
| 37614.0 | 0.093 |
| 37615.0 | 0.26 |
| 37616.0 | 0.098 |
| 37617.0 | 0.097 |
| 37618.0 | 0.095 |
| 37619.0 | 0.093 |
| 37620.0 | 0.091 |
| 37621.0 | 0.089 |
| 37622.0 | 0.21 |
| 37623.0 | 0.098 |
| 37624.0 | 0.096 |
| 37625.0 | 0.095 |
| 37626.0 | 0.094 |
| 37627.0 | 0.092 |
| 37628.0 | 0.089 |
| 37629.0 | 0.088 |
| 37630.0 | 0.086 |
| 37631.0 | 0.084 |
| 37632.0 | 0.086 |
| 37633.0 | 0.084 |
| 37634.0 | 0.084 |
| 37635.0 | 0.087 |
| 37636.0 | 0.086 |
| 37637.0 | 0.084 |
| 37638.0 | 0.081 |
| 37639.0 | 0.079 |
| 37640.0 | 0.078 |
| 37641.0 | 0.077 |
| 37642.0 | 0.074 |
| 37643.0 | 0.072 |
| 37644.0 | 0.072 |
| 37645.0 | 0.071 |
| 37646.0 | 0.07 |
| 37647.0 | 0.068 |
| 37648.0 | 0.066 |
| 37649.0 | 0.064 |
| 37650.0 | 0.062 |
| 37651.0 | 0.059 |
| 37652.0 | 0.057 |
| 37653.0 | 0.054 |
| 37654.0 | 0.052 |
| 37655.0 | 0.049 |
| 37656.0 | 0.046 |
| 37657.0 | 0.056 |
| 37658.0 | 0.054 |
| 37659.0 | 0.059 |
| 37660.0 | 0.162 |
| 37661.0 | 0.1 |
| 37662.0 | 0.139 |
| 37663.0 | 0.112 |
| 37664.0 | 0.099 |
| 37665.0 | 0.097 |
| 37666.0 | 0.094 |
| 37667.0 | 0.091 |
| 37668.0 | 0.087 |
| 37669.0 | 0.247 |
| 37670.0 | 0.099 |
| 37671.0 | 0.096 |
| 37672.0 | 0.093 |
| 37673.0 | 0.09 |
| 37674.0 | 0.087 |
| 37675.0 | 0.154 |
| 37676.0 | 0.097 |
| 37677.0 | 0.094 |
| 37678.0 | 0.091 |
| 37679.0 | 0.087 |
| 37680.0 | 0.132 |
| 37681.0 | 0.117 |
| 37682.0 | 0.22 |
| 37683.0 | 0.098 |
| 37684.0 | 0.12 |
| 37685.0 | 0.157 |
| 37686.0 | 0.096 |
| 37687.0 | 0.093 |
| 37688.0 | 0.11 |
| 37689.0 | 0.1 |
| 37690.0 | 0.227 |
| 37691.0 | 0.097 |
| 37692.0 | 0.092 |
| 37693.0 | 0.088 |
| 37694.0 | 0.084 |
| 37695.0 | 0.08 |
| 37696.0 | 0.077 |
| 37697.0 | 0.074 |
| 37698.0 | 0.091 |
| 37699.0 | 0.087 |
| 37700.0 | 0.083 |
| 37701.0 | 0.08 |
| 37702.0 | 0.075 |
| 37703.0 | 0.071 |
| 37704.0 | 0.071 |
| 37705.0 | 0.067 |
| 37706.0 | 0.063 |
| 37707.0 | 0.059 |
| 37708.0 | 0.195 |
| 37709.0 | 0.097 |
| 37710.0 | 0.093 |
| 37711.0 | 0.112 |
| 37712.0 | 0.1 |
| 37713.0 | 0.095 |
| 37714.0 | 0.091 |
| 37715.0 | 0.086 |
| 37716.0 | 0.081 |
| 37717.0 | 0.076 |
| 37718.0 | 0.07 |
| 37719.0 | 0.066 |
| 37720.0 | 0.114 |
| 37721.0 | 0.108 |
| 37722.0 | 0.101 |
| 37723.0 | 0.097 |
| 37724.0 | 0.093 |
| 37725.0 | 0.087 |
| 37726.0 | 0.082 |
| 37727.0 | 0.077 |
| 37728.0 | 0.072 |
| 37729.0 | 0.067 |
| 37730.0 | 0.062 |
| 37731.0 | 0.057 |
| 37732.0 | 0.053 |
| 37733.0 | 0.048 |
| 37734.0 | 0.044 |
| 37735.0 | 0.039 |
| 37736.0 | 0.034 |
| 37737.0 | 0.082 |
| 37738.0 | 0.078 |
| 37739.0 | 0.073 |
| 37740.0 | 0.068 |
| 37741.0 | 0.063 |
| 37742.0 | 0.058 |
| 37743.0 | 0.053 |
| 37744.0 | 0.047 |
| 37745.0 | 0.042 |
| 37746.0 | 0.036 |
| 37747.0 | 0.029 |
| 37748.0 | 0.024 |
| 37749.0 | 0.018 |
| 37750.0 | 0.012 |
| 37751.0 | 0.006 |
| 37752.0 | -0.001 |
| 37753.0 | -0.012 |
| 37754.0 | -0.02 |
| 37755.0 | -0.032 |
| 37756.0 | -0.044 |
| 37757.0 | -0.056 |
| 37758.0 | -0.068 |
| 37759.0 | -0.081 |
| 37760.0 | -0.089 |
| 37761.0 | 0.024 |
| 37762.0 | 0.02 |
| 37763.0 | 0.015 |
| 37764.0 | 0.05 |
| 37765.0 | 0.071 |
| 37766.0 | 0.067 |
| 37767.0 | 0.061 |
| 37768.0 | 0.056 |
| 37769.0 | 0.05 |
| 37770.0 | 0.044 |
| 37771.0 | 0.038 |
| 37772.0 | 0.033 |
| 37773.0 | 0.028 |
| 37774.0 | 0.025 |
| 37775.0 | 0.044 |
| 37776.0 | 0.186 |
| 37777.0 | 0.179 |
| 37778.0 | 0.12 |
| 37779.0 | 0.095 |
| 37780.0 | 0.109 |
| 37781.0 | 0.234 |
| 37782.0 | 0.094 |
| 37783.0 | 0.09 |
| 37784.0 | 0.084 |
| 37785.0 | 0.117 |
| 37786.0 | 0.095 |
| 37787.0 | 0.09 |
| 37788.0 | 0.084 |
| 37789.0 | 0.079 |
| 37790.0 | 0.074 |
| 37791.0 | 0.114 |
| 37792.0 | 0.144 |
| 37793.0 | 0.185 |
| 37794.0 | 0.262 |
| 37795.0 | 0.103 |
| 37796.0 | 0.096 |
| 37797.0 | 0.09 |
| 37798.0 | 0.085 |
| 37799.0 | 0.078 |
| 37800.0 | 0.072 |
| 37801.0 | 0.071 |
| 37802.0 | 0.068 |
| 37803.0 | 0.064 |
| 37804.0 | 0.059 |
| 37805.0 | 0.073 |
| 37806.0 | 0.077 |
| 37807.0 | 0.072 |
| 37808.0 | 0.067 |
| 37809.0 | 0.105 |
| 37810.0 | 0.097 |
| 37811.0 | 0.091 |
| 37812.0 | 0.085 |
| 37813.0 | 0.082 |
| 37814.0 | 0.079 |
| 37815.0 | 0.075 |
| 37816.0 | 0.075 |
| 37817.0 | 0.188 |
| 37818.0 | 0.096 |
| 37819.0 | 0.092 |
| 37820.0 | 0.087 |
| 37821.0 | 0.081 |
| 37822.0 | 0.075 |
| 37823.0 | 0.07 |
| 37824.0 | 0.066 |
| 37825.0 | 0.094 |
| 37826.0 | 0.091 |
| 37827.0 | 0.124 |
| 37828.0 | 0.113 |
| 37829.0 | 0.096 |
| 37830.0 | 0.111 |
| 37831.0 | 0.109 |
| 37832.0 | 0.097 |
| 37833.0 | 0.094 |
| 37834.0 | 0.106 |
| 37835.0 | 0.124 |
| 37836.0 | 0.15 |
| 37837.0 | 0.144 |
| 37838.0 | 0.098 |
| 37839.0 | 0.107 |
| 37840.0 | 0.098 |
| 37841.0 | 0.163 |
| 37842.0 | 0.127 |
| 37843.0 | 0.097 |
| 37844.0 | 0.092 |
| 37845.0 | 0.094 |
| 37846.0 | 0.117 |
| 37847.0 | 0.098 |
| 37848.0 | 0.099 |
| 37849.0 | 0.121 |
| 37850.0 | 0.095 |
| 37851.0 | 0.09 |
| 37852.0 | 0.085 |
| 37853.0 | 0.081 |
| 37854.0 | 0.08 |
| 37855.0 | 0.153 |
| 37856.0 | 0.101 |
| 37857.0 | 0.097 |
| 37858.0 | 0.092 |
| 37859.0 | 0.086 |
| 37860.0 | 0.088 |
| 37861.0 | 0.085 |
| 37862.0 | 0.104 |
| 37863.0 | 0.238 |
| 37864.0 | 0.096 |
| 37865.0 | 0.091 |
| 37866.0 | 0.124 |
| 37867.0 | 0.165 |
| 37868.0 | 0.261 |
| 37869.0 | 0.113 |
| 37870.0 | 0.1 |
| 37871.0 | 0.099 |
| 37872.0 | 0.097 |
| 37873.0 | 0.093 |
| 37874.0 | 0.089 |
| 37875.0 | 0.084 |
| 37876.0 | 0.08 |
| 37877.0 | 0.076 |
| 37878.0 | 0.071 |
| 37879.0 | 0.067 |
| 37880.0 | 0.062 |
| 37881.0 | 0.058 |
| 37882.0 | 0.053 |
| 37883.0 | 0.049 |
| 37884.0 | 0.044 |
| 37885.0 | 0.039 |
| 37886.0 | 0.049 |
| 37887.0 | 0.045 |
| 37888.0 | 0.046 |
| 37889.0 | 0.044 |
| 37890.0 | 0.104 |
| 37891.0 | 0.103 |
| 37892.0 | 0.098 |
| 37893.0 | 0.302 |
| 37894.0 | 0.097 |
| 37895.0 | 0.094 |
| 37896.0 | 0.095 |
| 37897.0 | 0.092 |
| 37898.0 | 0.089 |
| 37899.0 | 0.085 |
| 37900.0 | 0.082 |
| 37901.0 | 0.078 |
| 37902.0 | 0.228 |
| 37903.0 | 0.097 |
| 37904.0 | 0.094 |
| 37905.0 | 0.092 |
| 37906.0 | 0.153 |
| 37907.0 | 0.101 |
| 37908.0 | 0.14 |
| 37909.0 | 0.097 |
| 37910.0 | 0.094 |
| 37911.0 | 0.09 |
| 37912.0 | 0.087 |
| 37913.0 | 0.084 |
| 37914.0 | 0.081 |
| 37915.0 | 0.077 |
| 37916.0 | 0.073 |
| 37917.0 | 0.07 |
| 37918.0 | 0.066 |
| 37919.0 | 0.062 |
| 37920.0 | 0.058 |
| 37921.0 | 0.056 |
| 37922.0 | 0.053 |
| 37923.0 | 0.074 |
| 37924.0 | 0.071 |
| 37925.0 | 0.067 |
| 37926.0 | 0.064 |
| 37927.0 | 0.061 |
| 37928.0 | 0.058 |
| 37929.0 | 0.055 |
| 37930.0 | 0.052 |
| 37931.0 | 0.053 |
| 37932.0 | 0.052 |
| 37933.0 | 0.049 |
| 37934.0 | 0.046 |
| 37935.0 | 0.044 |
| 37936.0 | 0.042 |
| 37937.0 | 0.042 |
| 37938.0 | 0.04 |
| 37939.0 | 0.037 |
| 37940.0 | 0.034 |
| 37941.0 | 0.031 |
| 37942.0 | 0.028 |
| 37943.0 | 0.025 |
| 37944.0 | 0.022 |
| 37945.0 | 0.074 |
| 37946.0 | 0.072 |
| 37947.0 | 0.069 |
| 37948.0 | 0.066 |
| 37949.0 | 0.063 |
| 37950.0 | 0.061 |
| 37951.0 | 0.06 |
| 37952.0 | 0.057 |
| 37953.0 | 0.054 |
| 37954.0 | 0.086 |
| 37955.0 | 0.085 |
| 37956.0 | 0.082 |
| 37957.0 | 0.08 |
| 37958.0 | 0.078 |
| 37959.0 | 0.076 |
| 37960.0 | 0.074 |
| 37961.0 | 0.072 |
| 37962.0 | 0.071 |
| 37963.0 | 0.07 |
| 37964.0 | 0.068 |
| 37965.0 | 0.065 |
| 37966.0 | 0.08 |
| 37967.0 | 0.078 |
| 37968.0 | 0.076 |
| 37969.0 | 0.074 |
| 37970.0 | 0.093 |
| 37971.0 | 0.091 |
| 37972.0 | 0.091 |
| 37973.0 | 0.09 |
| 37974.0 | 0.088 |
| 37975.0 | 0.086 |
| 37976.0 | 0.085 |
| 37977.0 | 0.083 |
| 37978.0 | 0.081 |
| 37979.0 | 0.079 |
| 37980.0 | 0.087 |
| 37981.0 | 0.085 |
| 37982.0 | 0.084 |
| 37983.0 | 0.081 |
| 37984.0 | 0.079 |
| 37985.0 | 0.077 |
| 37986.0 | 0.075 |
| 37987.0 | 0.073 |
| 37988.0 | 0.071 |
| 37989.0 | 0.068 |
| 37990.0 | 0.065 |
| 37991.0 | 0.063 |
| 37992.0 | 0.06 |
| 37993.0 | 0.061 |
| 37994.0 | 0.06 |
| 37995.0 | 0.057 |
| 37996.0 | 0.06 |
| 37997.0 | 0.059 |
| 37998.0 | 0.058 |
| 37999.0 | 0.056 |
| 38000.0 | 0.053 |
| 38001.0 | 0.051 |
| 38002.0 | 0.049 |
| 38003.0 | 0.047 |
| 38004.0 | 0.045 |
| 38005.0 | 0.07 |
| 38006.0 | 0.072 |
| 38007.0 | 0.071 |
| 38008.0 | 0.069 |
| 38009.0 | 0.067 |
| 38010.0 | 0.065 |
| 38011.0 | 0.062 |
| 38012.0 | 0.059 |
| 38013.0 | 0.098 |
| 38014.0 | 0.098 |
| 38015.0 | 0.096 |
| 38016.0 | 0.094 |
| 38017.0 | 0.092 |
| 38018.0 | 0.102 |
| 38019.0 | 0.192 |
| 38020.0 | 0.118 |
| 38021.0 | 0.098 |
| 38022.0 | 0.096 |
| 38023.0 | 0.093 |
| 38024.0 | 0.137 |
| 38025.0 | 0.117 |
| 38026.0 | 0.098 |
| 38027.0 | 0.096 |
| 38028.0 | 0.104 |
| 38029.0 | 0.104 |
| 38030.0 | 0.099 |
| 38031.0 | 0.101 |
| 38032.0 | 0.173 |
| 38033.0 | 0.097 |
| 38034.0 | 0.095 |
| 38035.0 | 0.096 |
| 38036.0 | 0.094 |
| 38037.0 | 0.091 |
| 38038.0 | 0.088 |
| 38039.0 | 0.085 |
| 38040.0 | 0.082 |
| 38041.0 | 0.111 |
| 38042.0 | 0.181 |
| 38043.0 | 0.111 |
| 38044.0 | 0.104 |
| 38045.0 | 0.101 |
| 38046.0 | 0.098 |
| 38047.0 | 0.095 |
| 38048.0 | 0.091 |
| 38049.0 | 0.087 |
| 38050.0 | 0.083 |
| 38051.0 | 0.079 |
| 38052.0 | 0.075 |
| 38053.0 | 0.072 |
| 38054.0 | 0.068 |
| 38055.0 | 0.064 |
| 38056.0 | 0.064 |
| 38057.0 | 0.061 |
| 38058.0 | 0.057 |
| 38059.0 | 0.053 |
| 38060.0 | 0.049 |
| 38061.0 | 0.045 |
| 38062.0 | 0.046 |
| 38063.0 | 0.106 |
| 38064.0 | 0.099 |
| 38065.0 | 0.094 |
| 38066.0 | 0.089 |
| 38067.0 | 0.085 |
| 38068.0 | 0.081 |
| 38069.0 | 0.077 |
| 38070.0 | 0.074 |
| 38071.0 | 0.07 |
| 38072.0 | 0.067 |
| 38073.0 | 0.063 |
| 38074.0 | 0.059 |
| 38075.0 | 0.055 |
| 38076.0 | 0.05 |
| 38077.0 | 0.045 |
| 38078.0 | 0.041 |
| 38079.0 | 0.037 |
| 38080.0 | 0.033 |
| 38081.0 | 0.028 |
| 38082.0 | 0.024 |
| 38083.0 | 0.019 |
| 38084.0 | 0.014 |
| 38085.0 | 0.009 |
| 38086.0 | 0.005 |
| 38087.0 | -0.007 |
| 38088.0 | -0.021 |
| 38089.0 | -0.031 |
| 38090.0 | -0.032 |
| 38091.0 | 0.046 |
| 38092.0 | 0.043 |
| 38093.0 | 0.038 |
| 38094.0 | 0.033 |
| 38095.0 | 0.028 |
| 38096.0 | 0.022 |
| 38097.0 | 0.017 |
| 38098.0 | 0.011 |
| 38099.0 | 0.006 |
| 38100.0 | 0.001 |
| 38101.0 | -0.009 |
| 38102.0 | -0.02 |
| 38103.0 | -0.031 |
| 38104.0 | -0.034 |
| 38105.0 | -0.044 |
| 38106.0 | -0.055 |
| 38107.0 | -0.066 |
| 38108.0 | 0.003 |
| 38109.0 | -0.006 |
| 38110.0 | -0.015 |
| 38111.0 | 0.026 |
| 38112.0 | 0.021 |
| 38113.0 | 0.015 |
| 38114.0 | 0.008 |
| 38115.0 | 0.002 |
| 38116.0 | -0.007 |
| 38117.0 | -0.019 |
| 38118.0 | -0.031 |
| 38119.0 | -0.04 |
| 38120.0 | -0.051 |
| 38121.0 | -0.06 |
| 38122.0 | -0.071 |
| 38123.0 | -0.082 |
| 38124.0 | -0.093 |
| 38125.0 | -0.104 |
| 38126.0 | -0.115 |
| 38127.0 | -0.127 |
| 38128.0 | -0.139 |
| 38129.0 | -0.152 |
| 38130.0 | -0.165 |
| 38131.0 | -0.177 |
| 38132.0 | -0.178 |
| 38133.0 | -0.192 |
| 38134.0 | -0.205 |
| 38135.0 | -0.217 |
| 38136.0 | -0.23 |
| 38137.0 | -0.243 |
| 38138.0 | -0.257 |
| 38139.0 | -0.269 |
| 38140.0 | -0.282 |
| 38141.0 | -0.139 |
| 38142.0 | 0.021 |
| 38143.0 | 0.063 |
| 38144.0 | 0.057 |
| 38145.0 | 0.072 |
| 38146.0 | 0.145 |
| 38147.0 | 0.095 |
| 38148.0 | 0.183 |
| 38149.0 | 0.095 |
| 38150.0 | 0.089 |
| 38151.0 | 0.082 |
| 38152.0 | 0.128 |
| 38153.0 | 0.113 |
| 38154.0 | 0.097 |
| 38155.0 | 0.092 |
| 38156.0 | 0.086 |
| 38157.0 | 0.08 |
| 38158.0 | 0.074 |
| 38159.0 | 0.07 |
| 38160.0 | 0.065 |
| 38161.0 | 0.06 |
| 38162.0 | 0.055 |
| 38163.0 | 0.049 |
| 38164.0 | 0.043 |
| 38165.0 | 0.037 |
| 38166.0 | 0.031 |
| 38167.0 | 0.027 |
| 38168.0 | 0.022 |
| 38169.0 | 0.016 |
| 38170.0 | 0.109 |
| 38171.0 | 0.096 |
| 38172.0 | 0.1 |
| 38173.0 | 0.094 |
| 38174.0 | 0.088 |
| 38175.0 | 0.082 |
| 38176.0 | 0.184 |
| 38177.0 | 0.105 |
| 38178.0 | 0.097 |
| 38179.0 | 0.09 |
| 38180.0 | 0.214 |
| 38181.0 | 0.096 |
| 38182.0 | 0.09 |
| 38183.0 | 0.085 |
| 38184.0 | 0.101 |
| 38185.0 | 0.121 |
| 38186.0 | 0.119 |
| 38187.0 | 0.15 |
| 38188.0 | 0.135 |
| 38189.0 | 0.136 |
| 38190.0 | 0.094 |
| 38191.0 | 0.088 |
| 38192.0 | 0.082 |
| 38193.0 | 0.079 |
| 38194.0 | 0.074 |
| 38195.0 | 0.102 |
| 38196.0 | 0.163 |
| 38197.0 | 0.143 |
| 38198.0 | 0.095 |
| 38199.0 | 0.089 |
| 38200.0 | 0.084 |
| 38201.0 | 0.082 |
| 38202.0 | 0.137 |
| 38203.0 | 0.095 |
| 38204.0 | 0.09 |
| 38205.0 | 0.085 |
| 38206.0 | 0.108 |
| 38207.0 | 0.099 |
| 38208.0 | 0.095 |
| 38209.0 | 0.091 |
| 38210.0 | 0.152 |
| 38211.0 | 0.097 |
| 38212.0 | 0.129 |
| 38213.0 | 0.203 |
| 38214.0 | 0.099 |
| 38215.0 | 0.095 |
| 38216.0 | 0.09 |
| 38217.0 | 0.116 |
| 38218.0 | 0.118 |
| 38219.0 | 0.095 |
| 38220.0 | 0.089 |
| 38221.0 | 0.121 |
| 38222.0 | 0.105 |
| 38223.0 | 0.108 |
| 38224.0 | 0.098 |
| 38225.0 | 0.094 |
| 38226.0 | 0.098 |
| 38227.0 | 0.094 |
| 38228.0 | 0.089 |
| 38229.0 | 0.084 |
| 38230.0 | 0.079 |
| 38231.0 | 0.075 |
| 38232.0 | 0.072 |
| 38233.0 | 0.128 |
| 38234.0 | 0.111 |
| 38235.0 | 0.101 |
| 38236.0 | 0.26 |
| 38237.0 | 0.255 |
| 38238.0 | 0.164 |
| 38239.0 | 0.097 |
| 38240.0 | 0.144 |
| 38241.0 | 0.11 |
| 38242.0 | 0.1 |
| 38243.0 | 0.115 |
| 38244.0 | 0.114 |
| 38245.0 | 0.099 |
| 38246.0 | 0.097 |
| 38247.0 | 0.095 |
| 38248.0 | 0.093 |
| 38249.0 | 0.091 |
| 38250.0 | 0.089 |
| 38251.0 | 0.088 |
| 38252.0 | 0.099 |
| 38253.0 | 0.096 |
| 38254.0 | 0.092 |
| 38255.0 | 0.087 |
| 38256.0 | 0.088 |
| 38257.0 | 0.416 |
| 38258.0 | 0.103 |
| 38259.0 | 0.099 |
| 38260.0 | 0.095 |
| 38261.0 | 0.09 |
| 38262.0 | 0.087 |
| 38263.0 | 0.084 |
| 38264.0 | 0.08 |
| 38265.0 | 0.078 |
| 38266.0 | 0.074 |
| 38267.0 | 0.071 |
| 38268.0 | 0.071 |
| 38269.0 | 0.068 |
| 38270.0 | 0.065 |
| 38271.0 | 0.062 |
| 38272.0 | 0.078 |
| 38273.0 | 0.075 |
| 38274.0 | 0.071 |
| 38275.0 | 0.073 |
| 38276.0 | 0.113 |
| 38277.0 | 0.098 |
| 38278.0 | 0.094 |
| 38279.0 | 0.09 |
| 38280.0 | 0.087 |
| 38281.0 | 0.097 |
| 38282.0 | 0.094 |
| 38283.0 | 0.092 |
| 38284.0 | 0.089 |
| 38285.0 | 0.085 |
| 38286.0 | 0.082 |
| 38287.0 | 0.079 |
| 38288.0 | 0.075 |
| 38289.0 | 0.072 |
| 38290.0 | 0.075 |
| 38291.0 | 0.071 |
| 38292.0 | 0.068 |
| 38293.0 | 0.065 |
| 38294.0 | 0.062 |
| 38295.0 | 0.059 |
| 38296.0 | 0.068 |
| 38297.0 | 0.066 |
| 38298.0 | 0.063 |
| 38299.0 | 0.06 |
| 38300.0 | 0.058 |
| 38301.0 | 0.055 |
| 38302.0 | 0.053 |
| 38303.0 | 0.05 |
| 38304.0 | 0.05 |
| 38305.0 | 0.048 |
| 38306.0 | 0.047 |
| 38307.0 | 0.045 |
| 38308.0 | 0.042 |
| 38309.0 | 0.04 |
| 38310.0 | 0.037 |
| 38311.0 | 0.034 |
| 38312.0 | 0.034 |
| 38313.0 | 0.031 |
| 38314.0 | 0.029 |
| 38315.0 | 0.026 |
| 38316.0 | 0.148 |
| 38317.0 | 0.104 |
| 38318.0 | 0.1 |
| 38319.0 | 0.138 |
| 38320.0 | 0.098 |
| 38321.0 | 0.095 |
| 38322.0 | 0.093 |
| 38323.0 | 0.091 |
| 38324.0 | 0.089 |
| 38325.0 | 0.087 |
| 38326.0 | 0.088 |
| 38327.0 | 0.086 |
| 38328.0 | 0.083 |
| 38329.0 | 0.081 |
| 38330.0 | 0.079 |
| 38331.0 | 0.076 |
| 38332.0 | 0.127 |
| 38333.0 | 0.098 |
| 38334.0 | 0.097 |
| 38335.0 | 0.094 |
| 38336.0 | 0.093 |
| 38337.0 | 0.092 |
| 38338.0 | 0.09 |
| 38339.0 | 0.089 |
| 38340.0 | 0.087 |
| 38341.0 | 0.085 |
| 38342.0 | 0.084 |
| 38343.0 | 0.082 |
| 38344.0 | 0.079 |
| 38345.0 | 0.092 |
| 38346.0 | 0.101 |
| 38347.0 | 0.136 |
| 38348.0 | 0.115 |
| 38349.0 | 0.099 |
| 38350.0 | 0.097 |
| 38351.0 | 0.096 |
| 38352.0 | 0.093 |
| 38353.0 | 0.091 |
| 38354.0 | 0.089 |
| 38355.0 | 0.086 |
| 38356.0 | 0.084 |
| 38357.0 | 0.081 |
| 38358.0 | 0.079 |
| 38359.0 | 0.076 |
| 38360.0 | 0.074 |
| 38361.0 | 0.073 |
| 38362.0 | 0.07 |
| 38363.0 | 0.068 |
| 38364.0 | 0.066 |
| 38365.0 | 0.064 |
| 38366.0 | 0.061 |
| 38367.0 | 0.151 |
| 38368.0 | 0.099 |
| 38369.0 | 0.097 |
| 38370.0 | 0.096 |
| 38371.0 | 0.094 |
| 38372.0 | 0.093 |
| 38373.0 | 0.091 |
| 38374.0 | 0.088 |
| 38375.0 | 0.102 |
| 38376.0 | 0.101 |
| 38377.0 | 0.099 |
| 38378.0 | 0.097 |
| 38379.0 | 0.094 |
| 38380.0 | 0.092 |
| 38381.0 | 0.091 |
| 38382.0 | 0.115 |
| 38383.0 | 0.104 |
| 38384.0 | 0.101 |
| 38385.0 | 0.099 |
| 38386.0 | 0.117 |
| 38387.0 | 0.103 |
| 38388.0 | 0.1 |
| 38389.0 | 0.097 |
| 38390.0 | 0.094 |
| 38391.0 | 0.092 |
| 38392.0 | 0.088 |
| 38393.0 | 0.085 |
| 38394.0 | 0.097 |
| 38395.0 | 0.095 |
| 38396.0 | 0.092 |
| 38397.0 | 0.089 |
| 38398.0 | 0.088 |
| 38399.0 | 0.085 |
| 38400.0 | 0.082 |
| 38401.0 | 0.079 |
| 38402.0 | 0.077 |
| 38403.0 | 0.074 |
| 38404.0 | 0.071 |
| 38405.0 | 0.068 |
| 38406.0 | 0.065 |
| 38407.0 | 0.067 |
| 38408.0 | 0.067 |
| 38409.0 | 0.085 |
| 38410.0 | 0.083 |
| 38411.0 | 0.165 |
| 38412.0 | 0.097 |
| 38413.0 | 0.094 |
| 38414.0 | 0.092 |
| 38415.0 | 0.102 |
| 38416.0 | 0.098 |
| 38417.0 | 0.094 |
| 38418.0 | 0.091 |
| 38419.0 | 0.086 |
| 38420.0 | 0.14 |
| 38421.0 | 0.099 |
| 38422.0 | 0.096 |
| 38423.0 | 0.092 |
| 38424.0 | 0.088 |
| 38425.0 | 0.085 |
| 38426.0 | 0.082 |
| 38427.0 | 0.09 |
| 38428.0 | 0.134 |
| 38429.0 | 0.104 |
| 38430.0 | 0.101 |
| 38431.0 | 0.097 |
| 38432.0 | 0.093 |
| 38433.0 | 0.102 |
| 38434.0 | 0.109 |
| 38435.0 | 0.109 |
| 38436.0 | 0.098 |
| 38437.0 | 0.229 |
| 38438.0 | 0.178 |
| 38439.0 | 0.096 |
| 38440.0 | 0.099 |
| 38441.0 | 0.095 |
| 38442.0 | 0.09 |
| 38443.0 | 0.099 |
| 38444.0 | 0.19 |
| 38445.0 | 0.115 |
| 38446.0 | 0.097 |
| 38447.0 | 0.091 |
| 38448.0 | 0.086 |
| 38449.0 | 0.081 |
| 38450.0 | 0.175 |
| 38451.0 | 0.097 |
| 38452.0 | 0.093 |
| 38453.0 | 0.088 |
| 38454.0 | 0.083 |
| 38455.0 | 0.093 |
| 38456.0 | 0.089 |
| 38457.0 | 0.086 |
| 38458.0 | 0.082 |
| 38459.0 | 0.082 |
| 38460.0 | 0.077 |
| 38461.0 | 0.072 |
| 38462.0 | 0.067 |
| 38463.0 | 0.062 |
| 38464.0 | 0.056 |
| 38465.0 | 0.051 |
| 38466.0 | 0.051 |
| 38467.0 | 0.047 |
| 38468.0 | 0.042 |
| 38469.0 | 0.081 |
| 38470.0 | 0.076 |
| 38471.0 | 0.071 |
| 38472.0 | 0.066 |
| 38473.0 | 0.081 |
| 38474.0 | 0.081 |
| 38475.0 | 0.077 |
| 38476.0 | 0.071 |
| 38477.0 | 0.131 |
| 38478.0 | 0.181 |
| 38479.0 | 0.096 |
| 38480.0 | 0.091 |
| 38481.0 | 0.085 |
| 38482.0 | 0.08 |
| 38483.0 | 0.074 |
| 38484.0 | 0.071 |
| 38485.0 | 0.065 |
| 38486.0 | 0.059 |
| 38487.0 | 0.054 |
| 38488.0 | 0.048 |
| 38489.0 | 0.042 |
| 38490.0 | 0.037 |
| 38491.0 | 0.032 |
| 38492.0 | 0.026 |
| 38493.0 | 0.021 |
| 38494.0 | 0.08 |
| 38495.0 | 0.075 |
| 38496.0 | 0.069 |
| 38497.0 | 0.064 |
| 38498.0 | 0.059 |
| 38499.0 | 0.053 |
| 38500.0 | 0.047 |
| 38501.0 | 0.041 |
| 38502.0 | 0.035 |
| 38503.0 | 0.03 |
| 38504.0 | 0.132 |
| 38505.0 | 0.098 |
| 38506.0 | 0.102 |
| 38507.0 | 0.21 |
| 38508.0 | 0.097 |
| 38509.0 | 0.091 |
| 38510.0 | 0.087 |
| 38511.0 | 0.081 |
| 38512.0 | 0.076 |
| 38513.0 | 0.072 |
| 38514.0 | 0.075 |
| 38515.0 | 0.121 |
| 38516.0 | 0.098 |
| 38517.0 | 0.106 |
| 38518.0 | 0.155 |
| 38519.0 | 0.095 |
| 38520.0 | 0.096 |
| 38521.0 | 0.091 |
| 38522.0 | 0.118 |
| 38523.0 | 0.095 |
| 38524.0 | 0.089 |
| 38525.0 | 0.084 |
| 38526.0 | 0.078 |
| 38527.0 | 0.072 |
| 38528.0 | 0.071 |
| 38529.0 | 0.067 |
| 38530.0 | 0.062 |
| 38531.0 | 0.2 |
| 38532.0 | 0.106 |
| 38533.0 | 0.195 |
| 38534.0 | 0.11 |
| 38535.0 | 0.108 |
| 38536.0 | 0.116 |
| 38537.0 | 0.182 |
| 38538.0 | 0.096 |
| 38539.0 | 0.09 |
| 38540.0 | 0.084 |
| 38541.0 | 0.079 |
| 38542.0 | 0.073 |
| 38543.0 | 0.109 |
| 38544.0 | 0.211 |
| 38545.0 | 0.174 |
| 38546.0 | 0.095 |
| 38547.0 | 0.091 |
| 38548.0 | 0.086 |
| 38549.0 | 0.081 |
| 38550.0 | 0.075 |
| 38551.0 | 0.073 |
| 38552.0 | 0.067 |
| 38553.0 | 0.062 |
| 38554.0 | 0.056 |
| 38555.0 | 0.05 |
| 38556.0 | 0.044 |
| 38557.0 | 0.048 |
| 38558.0 | 0.046 |
| 38559.0 | 0.04 |
| 38560.0 | 0.034 |
| 38561.0 | 0.028 |
| 38562.0 | 0.023 |
| 38563.0 | 0.027 |
| 38564.0 | 0.022 |
| 38565.0 | 0.027 |
| 38566.0 | 0.022 |
| 38567.0 | 0.017 |
| 38568.0 | 0.012 |
| 38569.0 | 0.009 |
| 38570.0 | 0.081 |
| 38571.0 | 0.081 |
| 38572.0 | 0.084 |
| 38573.0 | 0.097 |
| 38574.0 | 0.092 |
| 38575.0 | 0.088 |
| 38576.0 | 0.083 |
| 38577.0 | 0.082 |
| 38578.0 | 0.077 |
| 38579.0 | 0.128 |
| 38580.0 | 0.095 |
| 38581.0 | 0.089 |
| 38582.0 | 0.083 |
| 38583.0 | 0.078 |
| 38584.0 | 0.072 |
| 38585.0 | 0.073 |
| 38586.0 | 0.067 |
| 38587.0 | 0.178 |
| 38588.0 | 0.134 |
| 38589.0 | 0.095 |
| 38590.0 | 0.09 |
| 38591.0 | 0.086 |
| 38592.0 | 0.082 |
| 38593.0 | 0.077 |
| 38594.0 | 0.072 |
| 38595.0 | 0.069 |
| 38596.0 | 0.065 |
| 38597.0 | 0.061 |
| 38598.0 | 0.056 |
| 38599.0 | 0.052 |
| 38600.0 | 0.048 |
| 38601.0 | 0.044 |
| 38602.0 | 0.041 |
| 38603.0 | 0.038 |
| 38604.0 | 0.035 |
| 38605.0 | 0.03 |
| 38606.0 | 0.026 |
| 38607.0 | 0.021 |
| 38608.0 | 0.016 |
| 38609.0 | 0.011 |
| 38610.0 | 0.007 |
| 38611.0 | 0.002 |
| 38612.0 | -0.007 |
| 38613.0 | -0.017 |
| 38614.0 | -0.027 |
| 38615.0 | -0.036 |
| 38616.0 | -0.045 |
| 38617.0 | -0.051 |
| 38618.0 | -0.059 |
| 38619.0 | -0.067 |
| 38620.0 | -0.076 |
| 38621.0 | -0.085 |
| 38622.0 | -0.095 |
| 38623.0 | -0.105 |
| 38624.0 | -0.114 |
| 38625.0 | -0.123 |
| 38626.0 | -0.133 |
| 38627.0 | -0.142 |
| 38628.0 | -0.054 |
| 38629.0 | -0.038 |
| 38630.0 | 0.015 |
| 38631.0 | 0.063 |
| 38632.0 | 0.251 |
| 38633.0 | 0.129 |
| 38634.0 | 0.1 |
| 38635.0 | 0.097 |
| 38636.0 | 0.093 |
| 38637.0 | 0.091 |
| 38638.0 | 0.088 |
| 38639.0 | 0.085 |
| 38640.0 | 0.082 |
| 38641.0 | 0.078 |
| 38642.0 | 0.074 |
| 38643.0 | 0.071 |
| 38644.0 | 0.067 |
| 38645.0 | 0.063 |
| 38646.0 | 0.059 |
| 38647.0 | 0.079 |
| 38648.0 | 0.081 |
| 38649.0 | 0.139 |
| 38650.0 | 0.102 |
| 38651.0 | 0.103 |
| 38652.0 | 0.099 |
| 38653.0 | 0.096 |
| 38654.0 | 0.093 |
| 38655.0 | 0.09 |
| 38656.0 | 0.087 |
| 38657.0 | 0.084 |
| 38658.0 | 0.08 |
| 38659.0 | 0.078 |
| 38660.0 | 0.075 |
| 38661.0 | 0.072 |
| 38662.0 | 0.069 |
| 38663.0 | 0.066 |
| 38664.0 | 0.063 |
| 38665.0 | 0.06 |
| 38666.0 | 0.057 |
| 38667.0 | 0.054 |
| 38668.0 | 0.051 |
| 38669.0 | 0.048 |
| 38670.0 | 0.045 |
| 38671.0 | 0.042 |
| 38672.0 | 0.039 |
| 38673.0 | 0.036 |
| 38674.0 | 0.034 |
| 38675.0 | 0.032 |
| 38676.0 | 0.029 |
| 38677.0 | 0.027 |
| 38678.0 | 0.031 |
| 38679.0 | 0.029 |
| 38680.0 | 0.027 |
| 38681.0 | 0.024 |
| 38682.0 | 0.022 |
| 38683.0 | 0.019 |
| 38684.0 | 0.016 |
| 38685.0 | 0.015 |
| 38686.0 | 0.039 |
| 38687.0 | 0.037 |
| 38688.0 | 0.034 |
| 38689.0 | 0.033 |
| 38690.0 | 0.03 |
| 38691.0 | 0.028 |
| 38692.0 | 0.096 |
| 38693.0 | 0.095 |
| 38694.0 | 0.117 |
| 38695.0 | 0.287 |
| 38696.0 | 0.136 |
| 38697.0 | 0.098 |
| 38698.0 | 0.096 |
| 38699.0 | 0.095 |
| 38700.0 | 0.093 |
| 38701.0 | 0.091 |
| 38702.0 | 0.135 |
| 38703.0 | 0.098 |
| 38704.0 | 0.209 |
| 38705.0 | 0.211 |
| 38706.0 | 0.104 |
| 38707.0 | 0.1 |
| 38708.0 | 0.099 |
| 38709.0 | 0.097 |
| 38710.0 | 0.095 |
| 38711.0 | 0.093 |
| 38712.0 | 0.152 |
| 38713.0 | 0.098 |
| 38714.0 | 0.097 |
| 38715.0 | 0.096 |
| 38716.0 | 0.094 |
| 38717.0 | 0.091 |
| 38718.0 | 0.089 |
| 38719.0 | 0.091 |
| 38720.0 | 0.255 |
| 38721.0 | 0.099 |
| 38722.0 | 0.097 |
| 38723.0 | 0.094 |
| 38724.0 | 0.093 |
| 38725.0 | 0.091 |
| 38726.0 | 0.089 |
| 38727.0 | 0.087 |
| 38728.0 | 0.084 |
| 38729.0 | 0.082 |
| 38730.0 | 0.079 |
| 38731.0 | 0.099 |
| 38732.0 | 0.097 |
| 38733.0 | 0.095 |
| 38734.0 | 0.093 |
| 38735.0 | 0.095 |
| 38736.0 | 0.101 |
| 38737.0 | 0.098 |
| 38738.0 | 0.096 |
| 38739.0 | 0.093 |
| 38740.0 | 0.091 |
| 38741.0 | 0.092 |
| 38742.0 | 0.089 |
| 38743.0 | 0.087 |
| 38744.0 | 0.085 |
| 38745.0 | 0.083 |
| 38746.0 | 0.081 |
| 38747.0 | 0.126 |
| 38748.0 | 0.128 |
| 38749.0 | 0.11 |
| 38750.0 | 0.1 |
| 38751.0 | 0.096 |
| 38752.0 | 0.094 |
| 38753.0 | 0.191 |
| 38754.0 | 0.098 |
| 38755.0 | 0.095 |
| 38756.0 | 0.103 |
| 38757.0 | 0.1 |
| 38758.0 | 0.097 |
| 38759.0 | 0.095 |
| 38760.0 | 0.119 |
| 38761.0 | 0.098 |
| 38762.0 | 0.097 |
| 38763.0 | 0.094 |
| 38764.0 | 0.091 |
| 38765.0 | 0.088 |
| 38766.0 | 0.085 |
| 38767.0 | 0.081 |
| 38768.0 | 0.079 |
| 38769.0 | 0.076 |
| 38770.0 | 0.077 |
| 38771.0 | 0.074 |
| 38772.0 | 0.14 |
| 38773.0 | 0.097 |
| 38774.0 | 0.094 |
| 38775.0 | 0.28 |
| 38776.0 | 0.097 |
| 38777.0 | 0.094 |
| 38778.0 | 0.09 |
| 38779.0 | 0.086 |
| 38780.0 | 0.082 |
| 38781.0 | 0.079 |
| 38782.0 | 0.075 |
| 38783.0 | 0.071 |
| 38784.0 | 0.067 |
| 38785.0 | 0.064 |
| 38786.0 | 0.059 |
| 38787.0 | 0.055 |
| 38788.0 | 0.051 |
| 38789.0 | 0.047 |
| 38790.0 | 0.043 |
| 38791.0 | 0.086 |
| 38792.0 | 0.083 |
| 38793.0 | 0.079 |
| 38794.0 | 0.075 |
| 38795.0 | 0.071 |
| 38796.0 | 0.067 |
| 38797.0 | 0.063 |
| 38798.0 | 0.183 |
| 38799.0 | 0.096 |
| 38800.0 | 0.099 |
| 38801.0 | 0.096 |
| 38802.0 | 0.093 |
| 38803.0 | 0.09 |
| 38804.0 | 0.086 |
| 38805.0 | 0.082 |
| 38806.0 | 0.078 |
| 38807.0 | 0.074 |
| 38808.0 | 0.069 |
| 38809.0 | 0.064 |
| 38810.0 | 0.059 |
| 38811.0 | 0.054 |
| 38812.0 | 0.049 |
| 38813.0 | 0.044 |
| 38814.0 | 0.038 |
| 38815.0 | 0.032 |
| 38816.0 | 0.148 |
| 38817.0 | 0.096 |
| 38818.0 | 0.092 |
| 38819.0 | 0.087 |
| 38820.0 | 0.082 |
| 38821.0 | 0.077 |
| 38822.0 | 0.072 |
| 38823.0 | 0.066 |
| 38824.0 | 0.062 |
| 38825.0 | 0.057 |
| 38826.0 | 0.053 |
| 38827.0 | 0.048 |
| 38828.0 | 0.042 |
| 38829.0 | 0.123 |
| 38830.0 | 0.106 |
| 38831.0 | 0.097 |
| 38832.0 | 0.092 |
| 38833.0 | 0.087 |
| 38834.0 | 0.107 |
| 38835.0 | 0.101 |
| 38836.0 | 0.096 |
| 38837.0 | 0.091 |
| 38838.0 | 0.087 |
| 38839.0 | 0.082 |
| 38840.0 | 0.076 |
| 38841.0 | 0.069 |
| 38842.0 | 0.063 |
| 38843.0 | 0.058 |
| 38844.0 | 0.062 |
| 38845.0 | 0.057 |
| 38846.0 | 0.071 |
| 38847.0 | 0.073 |
| 38848.0 | 0.067 |
| 38849.0 | 0.073 |
| 38850.0 | 0.068 |
| 38851.0 | 0.062 |
| 38852.0 | 0.056 |
| 38853.0 | 0.051 |
| 38854.0 | 0.047 |
| 38855.0 | 0.041 |
| 38856.0 | 0.035 |
| 38857.0 | 0.03 |
| 38858.0 | 0.024 |
| 38859.0 | 0.018 |
| 38860.0 | 0.011 |
| 38861.0 | 0.005 |
| 38862.0 | -0.002 |
| 38863.0 | -0.014 |
| 38864.0 | -0.027 |
| 38865.0 | -0.039 |
| 38866.0 | -0.052 |
| 38867.0 | -0.064 |
| 38868.0 | -0.077 |
| 38869.0 | -0.089 |
| 38870.0 | -0.1 |
| 38871.0 | -0.002 |
| 38872.0 | 0.041 |
| 38873.0 | 0.035 |
| 38874.0 | 0.029 |
| 38875.0 | 0.023 |
| 38876.0 | 0.017 |
| 38877.0 | 0.01 |
| 38878.0 | 0.003 |
| 38879.0 | -0.005 |
| 38880.0 | -0.016 |
| 38881.0 | 0.073 |
| 38882.0 | 0.215 |
| 38883.0 | 0.095 |
| 38884.0 | 0.09 |
| 38885.0 | 0.084 |
| 38886.0 | 0.079 |
| 38887.0 | 0.073 |
| 38888.0 | 0.07 |
| 38889.0 | 0.064 |
| 38890.0 | 0.057 |
| 38891.0 | 0.051 |
| 38892.0 | 0.044 |
| 38893.0 | 0.038 |
| 38894.0 | 0.033 |
| 38895.0 | 0.028 |
| 38896.0 | 0.089 |
| 38897.0 | 0.084 |
| 38898.0 | 0.078 |
| 38899.0 | 0.072 |
| 38900.0 | 0.065 |
| 38901.0 | 0.059 |
| 38902.0 | 0.053 |
| 38903.0 | 0.046 |
| 38904.0 | 0.04 |
| 38905.0 | 0.038 |
| 38906.0 | 0.038 |
| 38907.0 | 0.032 |
| 38908.0 | 0.026 |
| 38909.0 | 0.019 |
| 38910.0 | 0.013 |
| 38911.0 | 0.009 |
| 38912.0 | 0.003 |
| 38913.0 | -0.007 |
| 38914.0 | -0.02 |
| 38915.0 | -0.033 |
| 38916.0 | -0.031 |
| 38917.0 | -0.044 |
| 38918.0 | -0.057 |
| 38919.0 | -0.07 |
| 38920.0 | -0.082 |
| 38921.0 | 0.022 |
| 38922.0 | 0.051 |
| 38923.0 | 0.05 |
| 38924.0 | 0.072 |
| 38925.0 | 0.067 |
| 38926.0 | 0.06 |
| 38927.0 | 0.054 |
| 38928.0 | 0.053 |
| 38929.0 | 0.053 |
| 38930.0 | 0.058 |
| 38931.0 | 0.052 |
| 38932.0 | 0.046 |
| 38933.0 | 0.041 |
| 38934.0 | 0.037 |
| 38935.0 | 0.031 |
| 38936.0 | 0.026 |
| 38937.0 | 0.019 |
| 38938.0 | 0.039 |
| 38939.0 | 0.042 |
| 38940.0 | 0.036 |
| 38941.0 | 0.031 |
| 38942.0 | 0.025 |
| 38943.0 | 0.02 |
| 38944.0 | 0.016 |
| 38945.0 | 0.011 |
| 38946.0 | 0.006 |
| 38947.0 | 0 |
| 38948.0 | 0.008 |
| 38949.0 | 0.003 |
| 38950.0 | -0.004 |
| 38951.0 | -0.01 |
| 38952.0 | -0.02 |
| 38953.0 | 0.064 |
| 38954.0 | 0.07 |
| 38955.0 | 0.124 |
| 38956.0 | 0.095 |
| 38957.0 | 0.103 |
| 38958.0 | 0.097 |
| 38959.0 | 0.091 |
| 38960.0 | 0.088 |
| 38961.0 | 0.083 |
| 38962.0 | 0.079 |
| 38963.0 | 0.074 |
| 38964.0 | 0.069 |
| 38965.0 | 0.064 |
| 38966.0 | 0.059 |
| 38967.0 | 0.055 |
| 38968.0 | 0.087 |
| 38969.0 | 0.084 |
| 38970.0 | 0.083 |
| 38971.0 | 0.079 |
| 38972.0 | 0.075 |
| 38973.0 | 0.071 |
| 38974.0 | 0.077 |
| 38975.0 | 0.074 |
| 38976.0 | 0.07 |
| 38977.0 | 0.065 |
| 38978.0 | 0.06 |
| 38979.0 | 0.08 |
| 38980.0 | 0.148 |
| 38981.0 | 0.095 |
| 38982.0 | 0.09 |
| 38983.0 | 0.085 |
| 38984.0 | 0.08 |
| 38985.0 | 0.075 |
| 38986.0 | 0.07 |
| 38987.0 | 0.065 |
| 38988.0 | 0.06 |
| 38989.0 | 0.055 |
| 38990.0 | 0.051 |
| 38991.0 | 0.045 |
| 38992.0 | 0.04 |
| 38993.0 | 0.036 |
| 38994.0 | 0.032 |
| 38995.0 | 0.028 |
| 38996.0 | 0.024 |
| 38997.0 | 0.02 |
| 38998.0 | 0.016 |
| 38999.0 | 0.013 |
| 39000.0 | 0.009 |
| 39001.0 | 0.005 |
| 39002.0 | 0.001 |
| 39003.0 | -0.005 |
| 39004.0 | -0.014 |
| 39005.0 | -0.021 |
| 39006.0 | -0.029 |
| 39007.0 | -0.037 |
| 39008.0 | -0.043 |
| 39009.0 | -0.044 |
| 39010.0 | 0.02 |
| 39011.0 | 0.016 |
| 39012.0 | 0.013 |
| 39013.0 | 0.009 |
| 39014.0 | 0.005 |
| 39015.0 | 0.002 |
| 39016.0 | -0.003 |
| 39017.0 | -0.009 |
| 39018.0 | 0.101 |
| 39019.0 | 0.124 |
| 39020.0 | 0.097 |
| 39021.0 | 0.093 |
| 39022.0 | 0.089 |
| 39023.0 | 0.085 |
| 39024.0 | 0.082 |
| 39025.0 | 0.08 |
| 39026.0 | 0.077 |
| 39027.0 | 0.076 |
| 39028.0 | 0.073 |
| 39029.0 | 0.095 |
| 39030.0 | 0.093 |
| 39031.0 | 0.09 |
| 39032.0 | 0.087 |
| 39033.0 | 0.084 |
| 39034.0 | 0.082 |
| 39035.0 | 0.08 |
| 39036.0 | 0.077 |
| 39037.0 | 0.082 |
| 39038.0 | 0.082 |
| 39039.0 | 0.08 |
| 39040.0 | 0.078 |
| 39041.0 | 0.076 |
| 39042.0 | 0.074 |
| 39043.0 | 0.073 |
| 39044.0 | 0.073 |
| 39045.0 | 0.07 |
| 39046.0 | 0.068 |
| 39047.0 | 0.065 |
| 39048.0 | 0.062 |
| 39049.0 | 0.06 |
| 39050.0 | 0.057 |
| 39051.0 | 0.06 |
| 39052.0 | 0.068 |
| 39053.0 | 0.079 |
| 39054.0 | 0.08 |
| 39055.0 | 0.079 |
| 39056.0 | 0.077 |
| 39057.0 | 0.075 |
| 39058.0 | 0.072 |
| 39059.0 | 0.072 |
| 39060.0 | 0.071 |
| 39061.0 | 0.069 |
| 39062.0 | 0.067 |
| 39063.0 | 0.065 |
| 39064.0 | 0.062 |
| 39065.0 | 0.06 |
| 39066.0 | 0.058 |
| 39067.0 | 0.056 |
| 39068.0 | 0.054 |
| 39069.0 | 0.051 |
| 39070.0 | 0.049 |
| 39071.0 | 0.046 |
| 39072.0 | 0.044 |
| 39073.0 | 0.042 |
| 39074.0 | 0.105 |
| 39075.0 | 0.117 |
| 39076.0 | 0.106 |
| 39077.0 | 0.236 |
| 39078.0 | 0.099 |
| 39079.0 | 0.097 |
| 39080.0 | 0.095 |
| 39081.0 | 0.093 |
| 39082.0 | 0.09 |
| 39083.0 | 0.088 |
| 39084.0 | 0.197 |
| 39085.0 | 0.1 |
| 39086.0 | 0.129 |
| 39087.0 | 0.098 |
| 39088.0 | 0.128 |
| 39089.0 | 0.098 |
| 39090.0 | 0.095 |
| 39091.0 | 0.103 |
| 39092.0 | 0.1 |
| 39093.0 | 0.099 |
| 39094.0 | 0.096 |
| 39095.0 | 0.094 |
| 39096.0 | 0.091 |
| 39097.0 | 0.089 |
| 39098.0 | 0.086 |
| 39099.0 | 0.084 |
| 39100.0 | 0.083 |
| 39101.0 | 0.082 |
| 39102.0 | 0.08 |
| 39103.0 | 0.078 |
| 39104.0 | 0.075 |
| 39105.0 | 0.079 |
| 39106.0 | 0.078 |
| 39107.0 | 0.085 |
| 39108.0 | 0.111 |
| 39109.0 | 0.1 |
| 39110.0 | 0.101 |
| 39111.0 | 0.117 |
| 39112.0 | 0.099 |
| 39113.0 | 0.097 |
| 39114.0 | 0.095 |
| 39115.0 | 0.194 |
| 39116.0 | 0.106 |
| 39117.0 | 0.101 |
| 39118.0 | 0.099 |
| 39119.0 | 0.097 |
| 39120.0 | 0.095 |
| 39121.0 | 0.091 |
| 39122.0 | 0.089 |
| 39123.0 | 0.086 |
| 39124.0 | 0.083 |
| 39125.0 | 0.08 |
| 39126.0 | 0.078 |
| 39127.0 | 0.074 |
| 39128.0 | 0.071 |
| 39129.0 | 0.069 |
| 39130.0 | 0.067 |
| 39131.0 | 0.065 |
| 39132.0 | 0.073 |
| 39133.0 | 0.071 |
| 39134.0 | 0.067 |
| 39135.0 | 0.064 |
| 39136.0 | 0.061 |
| 39137.0 | 0.058 |
| 39138.0 | 0.054 |
| 39139.0 | 0.051 |
| 39140.0 | 0.048 |
| 39141.0 | 0.05 |
| 39142.0 | 0.047 |
| 39143.0 | 0.044 |
| 39144.0 | 0.103 |
| 39145.0 | 0.1 |
| 39146.0 | 0.097 |
| 39147.0 | 0.094 |
| 39148.0 | 0.09 |
| 39149.0 | 0.086 |
| 39150.0 | 0.082 |
| 39151.0 | 0.102 |
| 39152.0 | 0.097 |
| 39153.0 | 0.093 |
| 39154.0 | 0.088 |
| 39155.0 | 0.084 |
| 39156.0 | 0.08 |
| 39157.0 | 0.076 |
| 39158.0 | 0.092 |
| 39159.0 | 0.089 |
| 39160.0 | 0.086 |
| 39161.0 | 0.082 |
| 39162.0 | 0.077 |
| 39163.0 | 0.073 |
| 39164.0 | 0.069 |
| 39165.0 | 0.064 |
| 39166.0 | 0.06 |
| 39167.0 | 0.055 |
| 39168.0 | 0.05 |
| 39169.0 | 0.046 |
| 39170.0 | 0.042 |
| 39171.0 | 0.037 |
| 39172.0 | 0.035 |
| 39173.0 | 0.032 |
| 39174.0 | 0.027 |
| 39175.0 | 0.022 |
| 39176.0 | 0.016 |
| 39177.0 | 0.011 |
| 39178.0 | 0.024 |
| 39179.0 | 0.02 |
| 39180.0 | 0.017 |
| 39181.0 | 0.013 |
| 39182.0 | 0.016 |
| 39183.0 | 0.014 |
| 39184.0 | 0.008 |
| 39185.0 | 0.003 |
| 39186.0 | -0.007 |
| 39187.0 | -0.018 |
| 39188.0 | -0.002 |
| 39189.0 | -0.011 |
| 39190.0 | -0.022 |
| 39191.0 | -0.002 |
| 39192.0 | -0.011 |
| 39193.0 | -0.019 |
| 39194.0 | -0.029 |
| 39195.0 | -0.039 |
| 39196.0 | -0.051 |
| 39197.0 | -0.062 |
| 39198.0 | -0.073 |
| 39199.0 | -0.084 |
| 39200.0 | -0.039 |
| 39201.0 | -0.049 |
| 39202.0 | -0.06 |
| 39203.0 | -0.072 |
| 39204.0 | -0.085 |
| 39205.0 | -0.066 |
| 39206.0 | -0.079 |
| 39207.0 | -0.054 |
| 39208.0 | -0.018 |
| 39209.0 | -0.029 |
| 39210.0 | -0.039 |
| 39211.0 | -0.049 |
| 39212.0 | -0.059 |
| 39213.0 | -0.069 |
| 39214.0 | -0.081 |
| 39215.0 | -0.094 |
| 39216.0 | 0.039 |
| 39217.0 | 0.035 |
| 39218.0 | 0.029 |
| 39219.0 | 0.023 |
| 39220.0 | 0.039 |
| 39221.0 | 0.035 |
| 39222.0 | 0.03 |
| 39223.0 | 0.023 |
| 39224.0 | 0.017 |
| 39225.0 | 0.011 |
| 39226.0 | 0.005 |
| 39227.0 | 0.004 |
| 39228.0 | -0.001 |
| 39229.0 | -0.012 |
| 39230.0 | -0.024 |
| 39231.0 | -0.036 |
| 39232.0 | -0.049 |
| 39233.0 | -0.061 |
| 39234.0 | -0.072 |
| 39235.0 | -0.077 |
| 39236.0 | 0.167 |
| 39237.0 | 0.095 |
| 39238.0 | 0.09 |
| 39239.0 | 0.085 |
| 39240.0 | 0.08 |
| 39241.0 | 0.131 |
| 39242.0 | 0.093 |
| 39243.0 | 0.124 |
| 39244.0 | 0.093 |
| 39245.0 | 0.087 |
| 39246.0 | 0.096 |
| 39247.0 | 0.096 |
| 39248.0 | 0.092 |
| 39249.0 | 0.085 |
| 39250.0 | 0.079 |
| 39251.0 | 0.072 |
| 39252.0 | 0.065 |
| 39253.0 | 0.06 |
| 39254.0 | 0.174 |
| 39255.0 | 0.099 |
| 39256.0 | 0.094 |
| 39257.0 | 0.087 |
| 39258.0 | 0.124 |
| 39259.0 | 0.095 |
| 39260.0 | 0.092 |
| 39261.0 | 0.087 |
| 39262.0 | 0.112 |
| 39263.0 | 0.096 |
| 39264.0 | 0.09 |
| 39265.0 | 0.088 |
| 39266.0 | 0.096 |
| 39267.0 | 0.094 |
| 39268.0 | 0.091 |
| 39269.0 | 0.089 |
| 39270.0 | 0.082 |
| 39271.0 | 0.076 |
| 39272.0 | 0.071 |
| 39273.0 | 0.065 |
| 39274.0 | 0.059 |
| 39275.0 | 0.059 |
| 39276.0 | 0.059 |
| 39277.0 | 0.054 |
| 39278.0 | 0.071 |
| 39279.0 | 0.079 |
| 39280.0 | 0.075 |
| 39281.0 | 0.078 |
| 39282.0 | 0.071 |
| 39283.0 | 0.065 |
| 39284.0 | 0.059 |
| 39285.0 | 0.057 |
| 39286.0 | 0.059 |
| 39287.0 | 0.053 |
| 39288.0 | 0.055 |
| 39289.0 | 0.067 |
| 39290.0 | 0.061 |
| 39291.0 | 0.055 |
| 39292.0 | 0.211 |
| 39293.0 | 0.095 |
| 39294.0 | 0.09 |
| 39295.0 | 0.128 |
| 39296.0 | 0.095 |
| 39297.0 | 0.133 |
| 39298.0 | 0.158 |
| 39299.0 | 0.097 |
| 39300.0 | 0.091 |
| 39301.0 | 0.086 |
| 39302.0 | 0.08 |
| 39303.0 | 0.074 |
| 39304.0 | 0.069 |
| 39305.0 | 0.07 |
| 39306.0 | 0.065 |
| 39307.0 | 0.068 |
| 39308.0 | 0.064 |
| 39309.0 | 0.074 |
| 39310.0 | 0.093 |
| 39311.0 | 0.088 |
| 39312.0 | 0.082 |
| 39313.0 | 0.077 |
| 39314.0 | 0.071 |
| 39315.0 | 0.065 |
| 39316.0 | 0.059 |
| 39317.0 | 0.053 |
| 39318.0 | 0.047 |
| 39319.0 | 0.045 |
| 39320.0 | 0.06 |
| 39321.0 | 0.065 |
| 39322.0 | 0.084 |
| 39323.0 | 0.08 |
| 39324.0 | 0.074 |
| 39325.0 | 0.151 |
| 39326.0 | 0.11 |
| 39327.0 | 0.124 |
| 39328.0 | 0.098 |
| 39329.0 | 0.094 |
| 39330.0 | 0.089 |
| 39331.0 | 0.084 |
| 39332.0 | 0.079 |
| 39333.0 | 0.074 |
| 39334.0 | 0.071 |
| 39335.0 | 0.066 |
| 39336.0 | 0.061 |
| 39337.0 | 0.057 |
| 39338.0 | 0.052 |
| 39339.0 | 0.068 |
| 39340.0 | 0.112 |
| 39341.0 | 0.12 |
| 39342.0 | 0.096 |
| 39343.0 | 0.094 |
| 39344.0 | 0.091 |
| 39345.0 | 0.126 |
| 39346.0 | 0.148 |
| 39347.0 | 0.156 |
| 39348.0 | 0.096 |
| 39349.0 | 0.102 |
| 39350.0 | 0.097 |
| 39351.0 | 0.099 |
| 39352.0 | 0.127 |
| 39353.0 | 0.095 |
| 39354.0 | 0.091 |
| 39355.0 | 0.087 |
| 39356.0 | 0.087 |
| 39357.0 | 0.089 |
| 39358.0 | 0.165 |
| 39359.0 | 0.099 |
| 39360.0 | 0.113 |
| 39361.0 | 0.146 |
| 39362.0 | 0.123 |
| 39363.0 | 0.107 |
| 39364.0 | 0.099 |
| 39365.0 | 0.095 |
| 39366.0 | 0.092 |
| 39367.0 | 0.087 |
| 39368.0 | 0.084 |
| 39369.0 | 0.08 |
| 39370.0 | 0.077 |
| 39371.0 | 0.073 |
| 39372.0 | 0.07 |
| 39373.0 | 0.067 |
| 39374.0 | 0.063 |
| 39375.0 | 0.059 |
| 39376.0 | 0.056 |
| 39377.0 | 0.059 |
| 39378.0 | 0.059 |
| 39379.0 | 0.056 |
| 39380.0 | 0.063 |
| 39381.0 | 0.06 |
| 39382.0 | 0.063 |
| 39383.0 | 0.061 |
| 39384.0 | 0.066 |
| 39385.0 | 0.07 |
| 39386.0 | 0.067 |
| 39387.0 | 0.064 |
| 39388.0 | 0.061 |
| 39389.0 | 0.059 |
| 39390.0 | 0.056 |
| 39391.0 | 0.054 |
| 39392.0 | 0.051 |
| 39393.0 | 0.048 |
| 39394.0 | 0.046 |
| 39395.0 | 0.043 |
| 39396.0 | 0.041 |
| 39397.0 | 0.038 |
| 39398.0 | 0.035 |
| 39399.0 | 0.033 |
| 39400.0 | 0.03 |
| 39401.0 | 0.027 |
| 39402.0 | 0.025 |
| 39403.0 | 0.023 |
| 39404.0 | 0.02 |
| 39405.0 | 0.017 |
| 39406.0 | 0.015 |
| 39407.0 | 0.012 |
| 39408.0 | 0.009 |
| 39409.0 | 0.047 |
| 39410.0 | 0.045 |
| 39411.0 | 0.042 |
| 39412.0 | 0.04 |
| 39413.0 | 0.037 |
| 39414.0 | 0.035 |
| 39415.0 | 0.033 |
| 39416.0 | 0.031 |
| 39417.0 | 0.029 |
| 39418.0 | 0.027 |
| 39419.0 | 0.024 |
| 39420.0 | 0.021 |
| 39421.0 | 0.019 |
| 39422.0 | 0.017 |
| 39423.0 | 0.014 |
| 39424.0 | 0.012 |
| 39425.0 | 0.01 |
| 39426.0 | 0.007 |
| 39427.0 | 0.005 |
| 39428.0 | 0.002 |
| 39429.0 | 0 |
| 39430.0 | -0.006 |
| 39431.0 | -0.011 |
| 39432.0 | -0.016 |
| 39433.0 | 0.071 |
| 39434.0 | 0.07 |
| 39435.0 | 0.068 |
| 39436.0 | 0.066 |
| 39437.0 | 0.063 |
| 39438.0 | 0.076 |
| 39439.0 | 0.074 |
| 39440.0 | 0.073 |
| 39441.0 | 0.071 |
| 39442.0 | 0.069 |
| 39443.0 | 0.068 |
| 39444.0 | 0.066 |
| 39445.0 | 0.063 |
| 39446.0 | 0.061 |
| 39447.0 | 0.059 |
| 39448.0 | 0.066 |
| 39449.0 | 0.064 |
| 39450.0 | 0.063 |
| 39451.0 | 0.062 |
| 39452.0 | 0.06 |
| 39453.0 | 0.057 |
| 39454.0 | 0.055 |
| 39455.0 | 0.052 |
| 39456.0 | 0.05 |
| 39457.0 | 0.047 |
| 39458.0 | 0.044 |
| 39459.0 | 0.054 |
| 39460.0 | 0.074 |
| 39461.0 | 0.072 |
| 39462.0 | 0.07 |
| 39463.0 | 0.069 |
| 39464.0 | 0.085 |
| 39465.0 | 0.108 |
| 39466.0 | 0.102 |
| 39467.0 | 0.185 |
| 39468.0 | 0.099 |
| 39469.0 | 0.097 |
| 39470.0 | 0.108 |
| 39471.0 | 0.104 |
| 39472.0 | 0.1 |
| 39473.0 | 0.099 |
| 39474.0 | 0.107 |
| 39475.0 | 0.101 |
| 39476.0 | 0.098 |
| 39477.0 | 0.096 |
| 39478.0 | 0.104 |
| 39479.0 | 0.1 |
| 39480.0 | 0.096 |
| 39481.0 | 0.093 |
| 39482.0 | 0.089 |
| 39483.0 | 0.086 |
| 39484.0 | 0.082 |
| 39485.0 | 0.079 |
| 39486.0 | 0.097 |
| 39487.0 | 0.095 |
| 39488.0 | 0.092 |
| 39489.0 | 0.089 |
| 39490.0 | 0.086 |
| 39491.0 | 0.084 |
| 39492.0 | 0.086 |
| 39493.0 | 0.088 |
| 39494.0 | 0.09 |
| 39495.0 | 0.092 |
| 39496.0 | 0.094 |
| 39497.0 | 0.096 |
| 39498.0 | 0.094 |
| 39499.0 | 0.091 |
| 39500.0 | 0.1 |
| 39501.0 | 0.186 |
| 39502.0 | 0.135 |
| 39503.0 | 0.097 |
| 39504.0 | 0.094 |
| 39505.0 | 0.142 |
| 39506.0 | 0.099 |
| 39507.0 | 0.096 |
| 39508.0 | 0.093 |
| 39509.0 | 0.089 |
| 39510.0 | 0.085 |
| 39511.0 | 0.08 |
| 39512.0 | 0.101 |
| 39513.0 | 0.098 |
| 39514.0 | 0.101 |
| 39515.0 | 0.293 |
| 39516.0 | 0.096 |
| 39517.0 | 0.093 |
| 39518.0 | 0.089 |
| 39519.0 | 0.086 |
| 39520.0 | 0.083 |
| 39521.0 | 0.078 |
| 39522.0 | 0.079 |
| 39523.0 | 0.075 |
| 39524.0 | 0.07 |
| 39525.0 | 0.066 |
| 39526.0 | 0.061 |
| 39527.0 | 0.057 |
| 39528.0 | 0.063 |
| 39529.0 | 0.058 |
| 39530.0 | 0.054 |
| 39531.0 | 0.05 |
| 39532.0 | 0.047 |
| 39533.0 | 0.043 |
| 39534.0 | 0.039 |
| 39535.0 | 0.034 |
| 39536.0 | 0.029 |
| 39537.0 | 0.024 |
| 39538.0 | 0.022 |
| 39539.0 | 0.017 |
| 39540.0 | 0.015 |
| 39541.0 | 0.049 |
| 39542.0 | 0.083 |
| 39543.0 | 0.117 |
| 39544.0 | 0.134 |
| 39545.0 | 0.125 |
| 39546.0 | 0.096 |
| 39547.0 | 0.092 |
| 39548.0 | 0.088 |
| 39549.0 | 0.082 |
| 39550.0 | 0.077 |
| 39551.0 | 0.071 |
| 39552.0 | 0.078 |
| 39553.0 | 0.074 |
| 39554.0 | 0.071 |
| 39555.0 | 0.066 |
| 39556.0 | 0.06 |
| 39557.0 | 0.054 |
| 39558.0 | 0.05 |
| 39559.0 | 0.044 |
| 39560.0 | 0.039 |
| 39561.0 | 0.033 |
| 39562.0 | 0.028 |
| 39563.0 | 0.023 |
| 39564.0 | 0.018 |
| 39565.0 | 0.012 |
| 39566.0 | 0.007 |
| 39567.0 | 0.052 |
| 39568.0 | 0.047 |
| 39569.0 | 0.041 |
| 39570.0 | 0.034 |
| 39571.0 | 0.028 |
| 39572.0 | 0.022 |
| 39573.0 | 0.016 |
| 39574.0 | 0.01 |
| 39575.0 | 0.003 |
| 39576.0 | -0.005 |
| 39577.0 | -0.016 |
| 39578.0 | -0.025 |
| 39579.0 | -0.035 |
| 39580.0 | -0.044 |
| 39581.0 | -0.056 |
| 39582.0 | -0.069 |
| 39583.0 | -0.082 |
| 39584.0 | -0.095 |
| 39585.0 | -0.064 |
| 39586.0 | -0.075 |
| 39587.0 | -0.077 |
| 39588.0 | -0.088 |
| 39589.0 | -0.101 |
| 39590.0 | -0.112 |
| 39591.0 | -0.12 |
| 39592.0 | -0.125 |
| 39593.0 | -0.136 |
| 39594.0 | -0.147 |
| 39595.0 | -0.159 |
| 39596.0 | -0.171 |
| 39597.0 | -0.184 |
| 39598.0 | -0.197 |
| 39599.0 | -0.21 |
| 39600.0 | -0.225 |
| 39601.0 | -0.196 |
| 39602.0 | -0.209 |
| 39603.0 | -0.221 |
| 39604.0 | -0.236 |
| 39605.0 | -0.25 |
| 39606.0 | -0.264 |
| 39607.0 | -0.279 |
| 39608.0 | -0.294 |
| 39609.0 | -0.277 |
| 39610.0 | -0.233 |
| 39611.0 | -0.217 |
| 39612.0 | -0.115 |
| 39613.0 | -0.125 |
| 39614.0 | 0.198 |
| 39615.0 | 0.12 |
| 39616.0 | 0.095 |
| 39617.0 | 0.088 |
| 39618.0 | 0.083 |
| 39619.0 | 0.077 |
| 39620.0 | 0.07 |
| 39621.0 | 0.077 |
| 39622.0 | 0.082 |
| 39623.0 | 0.086 |
| 39624.0 | 0.079 |
| 39625.0 | 0.074 |
| 39626.0 | 0.074 |
| 39627.0 | 0.114 |
| 39628.0 | 0.097 |
| 39629.0 | 0.109 |
| 39630.0 | 0.153 |
| 39631.0 | 0.095 |
| 39632.0 | 0.089 |
| 39633.0 | 0.083 |
| 39634.0 | 0.076 |
| 39635.0 | 0.07 |
| 39636.0 | 0.065 |
| 39637.0 | 0.072 |
| 39638.0 | 0.299 |
| 39639.0 | 0.094 |
| 39640.0 | 0.088 |
| 39641.0 | 0.082 |
| 39642.0 | 0.19 |
| 39643.0 | 0.095 |
| 39644.0 | 0.093 |
| 39645.0 | 0.108 |
| 39646.0 | 0.097 |
| 39647.0 | 0.173 |
| 39648.0 | 0.095 |
| 39649.0 | 0.089 |
| 39650.0 | 0.083 |
| 39651.0 | 0.077 |
| 39652.0 | 0.071 |
| 39653.0 | 0.079 |
| 39654.0 | 0.073 |
| 39655.0 | 0.067 |
| 39656.0 | 0.133 |
| 39657.0 | 0.095 |
| 39658.0 | 0.094 |
| 39659.0 | 0.099 |
| 39660.0 | 0.166 |
| 39661.0 | 0.103 |
| 39662.0 | 0.143 |
| 39663.0 | 0.098 |
| 39664.0 | 0.093 |
| 39665.0 | 0.088 |
| 39666.0 | 0.081 |
| 39667.0 | 0.075 |
| 39668.0 | 0.07 |
| 39669.0 | 0.065 |
| 39670.0 | 0.059 |
| 39671.0 | 0.053 |
| 39672.0 | 0.049 |
| 39673.0 | 0.112 |
| 39674.0 | 0.131 |
| 39675.0 | 0.123 |
| 39676.0 | 0.102 |
| 39677.0 | 0.099 |
| 39678.0 | 0.099 |
| 39679.0 | 0.095 |
| 39680.0 | 0.114 |
| 39681.0 | 0.099 |
| 39682.0 | 0.25 |
| 39683.0 | 0.285 |
| 39684.0 | 0.151 |
| 39685.0 | 0.139 |
| 39686.0 | 0.095 |
| 39687.0 | 0.09 |
| 39688.0 | 0.085 |
| 39689.0 | 0.079 |
| 39690.0 | 0.073 |
| 39691.0 | 0.075 |
| 39692.0 | 0.071 |
| 39693.0 | 0.067 |
| 39694.0 | 0.064 |
| 39695.0 | 0.06 |
| 39696.0 | 0.055 |
| 39697.0 | 0.051 |
| 39698.0 | 0.046 |
| 39699.0 | 0.041 |
| 39700.0 | 0.035 |
| 39701.0 | 0.031 |
| 39702.0 | 0.038 |
| 39703.0 | 0.037 |
| 39704.0 | 0.033 |
| 39705.0 | 0.028 |
| 39706.0 | 0.024 |
| 39707.0 | 0.042 |
| 39708.0 | 0.038 |
| 39709.0 | 0.048 |
| 39710.0 | 0.044 |
| 39711.0 | 0.039 |
| 39712.0 | 0.037 |
| 39713.0 | 0.077 |
| 39714.0 | 0.076 |
| 39715.0 | 0.072 |
| 39716.0 | 0.068 |
| 39717.0 | 0.063 |
| 39718.0 | 0.058 |
| 39719.0 | 0.053 |
| 39720.0 | 0.048 |
| 39721.0 | 0.043 |
| 39722.0 | 0.038 |
| 39723.0 | 0.035 |
| 39724.0 | 0.031 |
| 39725.0 | 0.027 |
| 39726.0 | 0.023 |
| 39727.0 | 0.022 |
| 39728.0 | 0.018 |
| 39729.0 | 0.015 |
| 39730.0 | 0.019 |
| 39731.0 | 0.133 |
| 39732.0 | 0.097 |
| 39733.0 | 0.094 |
| 39734.0 | 0.09 |
| 39735.0 | 0.096 |
| 39736.0 | 0.094 |
| 39737.0 | 0.09 |
| 39738.0 | 0.087 |
| 39739.0 | 0.083 |
| 39740.0 | 0.079 |
| 39741.0 | 0.076 |
| 39742.0 | 0.073 |
| 39743.0 | 0.07 |
| 39744.0 | 0.066 |
| 39745.0 | 0.066 |
| 39746.0 | 0.115 |
| 39747.0 | 0.099 |
| 39748.0 | 0.096 |
| 39749.0 | 0.092 |
| 39750.0 | 0.09 |
| 39751.0 | 0.087 |
| 39752.0 | 0.083 |
| 39753.0 | 0.08 |
| 39754.0 | 0.078 |
| 39755.0 | 0.075 |
| 39756.0 | 0.073 |
| 39757.0 | 0.071 |
| 39758.0 | 0.07 |
| 39759.0 | 0.067 |
| 39760.0 | 0.064 |
| 39761.0 | 0.061 |
| 39762.0 | 0.059 |
| 39763.0 | 0.056 |
| 39764.0 | 0.053 |
| 39765.0 | 0.05 |
| 39766.0 | 0.048 |
| 39767.0 | 0.048 |
| 39768.0 | 0.083 |
| 39769.0 | 0.082 |
| 39770.0 | 0.079 |
| 39771.0 | 0.077 |
| 39772.0 | 0.075 |
| 39773.0 | 0.074 |
| 39774.0 | 0.072 |
| 39775.0 | 0.07 |
| 39776.0 | 0.068 |
| 39777.0 | 0.065 |
| 39778.0 | 0.063 |
| 39779.0 | 0.061 |
| 39780.0 | 0.058 |
| 39781.0 | 0.055 |
| 39782.0 | 0.052 |
| 39783.0 | 0.16 |
| 39784.0 | 0.098 |
| 39785.0 | 0.102 |
| 39786.0 | 0.099 |
| 39787.0 | 0.097 |
| 39788.0 | 0.095 |
| 39789.0 | 0.094 |
| 39790.0 | 0.092 |
| 39791.0 | 0.09 |
| 39792.0 | 0.087 |
| 39793.0 | 0.085 |
| 39794.0 | 0.135 |
| 39795.0 | 0.098 |
| 39796.0 | 0.096 |
| 39797.0 | 0.094 |
| 39798.0 | 0.092 |
| 39799.0 | 0.09 |
| 39800.0 | 0.087 |
| 39801.0 | 0.085 |
| 39802.0 | 0.082 |
| 39803.0 | 0.08 |
| 39804.0 | 0.077 |
| 39805.0 | 0.076 |
| 39806.0 | 0.073 |
| 39807.0 | 0.071 |
| 39808.0 | 0.068 |
| 39809.0 | 0.066 |
| 39810.0 | 0.064 |
| 39811.0 | 0.061 |
| 39812.0 | 0.059 |
| 39813.0 | 0.056 |
| 39814.0 | 0.054 |
| 39815.0 | 0.052 |
| 39816.0 | 0.049 |
| 39817.0 | 0.047 |
| 39818.0 | 0.044 |
| 39819.0 | 0.042 |
| 39820.0 | 0.039 |
| 39821.0 | 0.042 |
| 39822.0 | 0.04 |
| 39823.0 | 0.037 |
| 39824.0 | 0.034 |
| 39825.0 | 0.035 |
| 39826.0 | 0.037 |
| 39827.0 | 0.109 |
| 39828.0 | 0.101 |
| 39829.0 | 0.1 |
| 39830.0 | 0.098 |
| 39831.0 | 0.097 |
| 39832.0 | 0.095 |
| 39833.0 | 0.094 |
| 39834.0 | 0.093 |
| 39835.0 | 0.091 |
| 39836.0 | 0.089 |
| 39837.0 | 0.087 |
| 39838.0 | 0.084 |
| 39839.0 | 0.082 |
| 39840.0 | 0.079 |
| 39841.0 | 0.077 |
| 39842.0 | 0.075 |
| 39843.0 | 0.205 |
| 39844.0 | 0.1 |
| 39845.0 | 0.098 |
| 39846.0 | 0.095 |
| 39847.0 | 0.121 |
| 39848.0 | 0.099 |
| 39849.0 | 0.097 |
| 39850.0 | 0.096 |
| 39851.0 | 0.093 |
| 39852.0 | 0.09 |
| 39853.0 | 0.087 |
| 39854.0 | 0.083 |
| 39855.0 | 0.08 |
| 39856.0 | 0.076 |
| 39857.0 | 0.074 |
| 39858.0 | 0.07 |
| 39859.0 | 0.079 |
| 39860.0 | 0.078 |
| 39861.0 | 0.076 |
| 39862.0 | 0.073 |
| 39863.0 | 0.07 |
| 39864.0 | 0.11 |
| 39865.0 | 0.1 |
| 39866.0 | 0.097 |
| 39867.0 | 0.094 |
| 39868.0 | 0.092 |
| 39869.0 | 0.089 |
| 39870.0 | 0.086 |
| 39871.0 | 0.083 |
| 39872.0 | 0.079 |
| 39873.0 | 0.076 |
| 39874.0 | 0.091 |
| 39875.0 | 0.088 |
| 39876.0 | 0.085 |
| 39877.0 | 0.082 |
| 39878.0 | 0.078 |
| 39879.0 | 0.073 |
| 39880.0 | 0.069 |
| 39881.0 | 0.064 |
| 39882.0 | 0.06 |
| 39883.0 | 0.055 |
| 39884.0 | 0.05 |
| 39885.0 | 0.045 |
| 39886.0 | 0.041 |
| 39887.0 | 0.037 |
| 39888.0 | 0.032 |
| 39889.0 | 0.028 |
| 39890.0 | 0.024 |
| 39891.0 | 0.02 |
| 39892.0 | 0.016 |
| 39893.0 | 0.012 |
| 39894.0 | 0.009 |
| 39895.0 | 0.005 |
| 39896.0 | 0.016 |
| 39897.0 | 0.013 |
| 39898.0 | 0.008 |
| 39899.0 | 0.005 |
| 39900.0 | 0.024 |
| 39901.0 | 0.182 |
| 39902.0 | 0.174 |
| 39903.0 | 0.096 |
| 39904.0 | 0.117 |
| 39905.0 | 0.22 |
| 39906.0 | 0.096 |
| 39907.0 | 0.101 |
| 39908.0 | 0.095 |
| 39909.0 | 0.09 |
| 39910.0 | 0.087 |
| 39911.0 | 0.083 |
| 39912.0 | 0.079 |
| 39913.0 | 0.074 |
| 39914.0 | 0.069 |
| 39915.0 | 0.064 |
| 39916.0 | 0.059 |
| 39917.0 | 0.089 |
| 39918.0 | 0.104 |
| 39919.0 | 0.097 |
| 39920.0 | 0.092 |
| 39921.0 | 0.088 |
| 39922.0 | 0.083 |
| 39923.0 | 0.078 |
| 39924.0 | 0.08 |
| 39925.0 | 0.075 |
| 39926.0 | 0.071 |
| 39927.0 | 0.066 |
| 39928.0 | 0.06 |
| 39929.0 | 0.054 |
| 39930.0 | 0.049 |
| 39931.0 | 0.043 |
| 39932.0 | 0.038 |
| 39933.0 | 0.032 |
| 39934.0 | 0.027 |
| 39935.0 | 0.021 |
| 39936.0 | 0.014 |
| 39937.0 | 0.008 |
| 39938.0 | 0.003 |
| 39939.0 | -0.007 |
| 39940.0 | -0.02 |
| 39941.0 | -0.032 |
| 39942.0 | -0.045 |
| 39943.0 | -0.058 |
| 39944.0 | -0.071 |
| 39945.0 | -0.084 |
| 39946.0 | -0.091 |
| 39947.0 | -0.102 |
| 39948.0 | -0.108 |
| 39949.0 | -0.119 |
| 39950.0 | -0.129 |
| 39951.0 | -0.082 |
| 39952.0 | -0.051 |
| 39953.0 | 0.042 |
| 39954.0 | 0.155 |
| 39955.0 | 0.119 |
| 39956.0 | 0.147 |
| 39957.0 | 0.107 |
| 39958.0 | 0.1 |
| 39959.0 | 0.096 |
| 39960.0 | 0.12 |
| 39961.0 | 0.097 |
| 39962.0 | 0.102 |
| 39963.0 | 0.096 |
| 39964.0 | 0.091 |
| 39965.0 | 0.084 |
| 39966.0 | 0.078 |
| 39967.0 | 0.071 |
| 39968.0 | 0.073 |
| 39969.0 | 0.13 |
| 39970.0 | 0.116 |
| 39971.0 | 0.096 |
| 39972.0 | 0.091 |
| 39973.0 | 0.085 |
| 39974.0 | 0.079 |
| 39975.0 | 0.072 |
| 39976.0 | 0.066 |
| 39977.0 | 0.06 |
| 39978.0 | 0.056 |
| 39979.0 | 0.05 |
| 39980.0 | 0.073 |
| 39981.0 | 0.083 |
| 39982.0 | 0.077 |
| 39983.0 | 0.085 |
| 39984.0 | 0.079 |
| 39985.0 | 0.073 |
| 39986.0 | 0.067 |
| 39987.0 | 0.06 |
| 39988.0 | 0.113 |
| 39989.0 | 0.095 |
| 39990.0 | 0.088 |
| 39991.0 | 0.082 |
| 39992.0 | 0.078 |
| 39993.0 | 0.072 |
| 39994.0 | 0.1 |
| 39995.0 | 0.138 |
| 39996.0 | 0.094 |
| 39997.0 | 0.088 |
| 39998.0 | 0.092 |
| 39999.0 | 0.086 |
| 40000.0 | 0.08 |
| 40001.0 | 0.11 |
| 40002.0 | 0.205 |
| 40003.0 | 0.156 |
| 40004.0 | 0.104 |
| 40005.0 | 0.099 |
| 40006.0 | 0.094 |
| 40007.0 | 0.129 |
| 40008.0 | 0.096 |
| 40009.0 | 0.091 |
| 40010.0 | 0.085 |
| 40011.0 | 0.114 |
| 40012.0 | 0.098 |
| 40013.0 | 0.106 |
| 40014.0 | 0.104 |
| 40015.0 | 0.097 |
| 40016.0 | 0.09 |
| 40017.0 | 0.094 |
| 40018.0 | 0.088 |
| 40019.0 | 0.095 |
| 40020.0 | 0.1 |
| 40021.0 | 0.095 |
| 40022.0 | 0.089 |
| 40023.0 | 0.083 |
| 40024.0 | 0.084 |
| 40025.0 | 0.08 |
| 40026.0 | 0.125 |
| 40027.0 | 0.106 |
| 40028.0 | 0.097 |
| 40029.0 | 0.099 |
| 40030.0 | 0.094 |
| 40031.0 | 0.355 |
| 40032.0 | 0.225 |
| 40033.0 | 0.094 |
| 40034.0 | 0.089 |
| 40035.0 | 0.083 |
| 40036.0 | 0.077 |
| 40037.0 | 0.071 |
| 40038.0 | 0.066 |
| 40039.0 | 0.073 |
| 40040.0 | 0.072 |
| 40041.0 | 0.067 |
| 40042.0 | 0.085 |
| 40043.0 | 0.083 |
| 40044.0 | 0.079 |
| 40045.0 | 0.073 |
| 40046.0 | 0.068 |
| 40047.0 | 0.063 |
| 40048.0 | 0.06 |
| 40049.0 | 0.055 |
| 40050.0 | 0.049 |
| 40051.0 | 0.043 |
| 40052.0 | 0.076 |
| 40053.0 | 0.18 |
| 40054.0 | 0.101 |
| 40055.0 | 0.096 |
| 40056.0 | 0.09 |
| 40057.0 | 0.085 |
| 40058.0 | 0.082 |
| 40059.0 | 0.083 |
| 40060.0 | 0.079 |
| 40061.0 | 0.074 |
| 40062.0 | 0.072 |
| 40063.0 | 0.069 |
| 40064.0 | 0.064 |
| 40065.0 | 0.059 |
| 40066.0 | 0.054 |
| 40067.0 | 0.049 |
| 40068.0 | 0.045 |
| 40069.0 | 0.101 |
| 40070.0 | 0.113 |
| 40071.0 | 0.097 |
| 40072.0 | 0.093 |
| 40073.0 | 0.088 |
| 40074.0 | 0.229 |
| 40075.0 | 0.097 |
| 40076.0 | 0.092 |
| 40077.0 | 0.087 |
| 40078.0 | 0.088 |
| 40079.0 | 0.083 |
| 40080.0 | 0.079 |
| 40081.0 | 0.082 |
| 40082.0 | 0.078 |
| 40083.0 | 0.073 |
| 40084.0 | 0.068 |
| 40085.0 | 0.063 |
| 40086.0 | 0.069 |
| 40087.0 | 0.065 |
| 40088.0 | 0.06 |
| 40089.0 | 0.056 |
| 40090.0 | 0.052 |
| 40091.0 | 0.048 |
| 40092.0 | 0.111 |
| 40093.0 | 0.099 |
| 40094.0 | 0.097 |
| 40095.0 | 0.093 |
| 40096.0 | 0.09 |
| 40097.0 | 0.086 |
| 40098.0 | 0.082 |
| 40099.0 | 0.078 |
| 40100.0 | 0.076 |
| 40101.0 | 0.075 |
| 40102.0 | 0.09 |
| 40103.0 | 0.096 |
| 40104.0 | 0.094 |
| 40105.0 | 0.091 |
| 40106.0 | 0.088 |
| 40107.0 | 0.084 |
| 40108.0 | 0.081 |
| 40109.0 | 0.077 |
| 40110.0 | 0.073 |
| 40111.0 | 0.069 |
| 40112.0 | 0.066 |
| 40113.0 | 0.062 |
| 40114.0 | 0.093 |
| 40115.0 | 0.089 |
| 40116.0 | 0.086 |
| 40117.0 | 0.083 |
| 40118.0 | 0.079 |
| 40119.0 | 0.076 |
| 40120.0 | 0.073 |
| 40121.0 | 0.071 |
| 40122.0 | 0.068 |
| 40123.0 | 0.065 |
| 40124.0 | 0.062 |
| 40125.0 | 0.059 |
| 40126.0 | 0.056 |
| 40127.0 | 0.053 |
| 40128.0 | 0.061 |
| 40129.0 | 0.083 |
| 40130.0 | 0.081 |
| 40131.0 | 0.079 |
| 40132.0 | 0.076 |
| 40133.0 | 0.073 |
| 40134.0 | 0.07 |
| 40135.0 | 0.067 |
| 40136.0 | 0.064 |
| 40137.0 | 0.061 |
| 40138.0 | 0.059 |
| 40139.0 | 0.056 |
| 40140.0 | 0.078 |
| 40141.0 | 0.075 |
| 40142.0 | 0.078 |
| 40143.0 | 0.105 |
| 40144.0 | 0.1 |
| 40145.0 | 0.098 |
| 40146.0 | 0.096 |
| 40147.0 | 0.093 |
| 40148.0 | 0.09 |
| 40149.0 | 0.089 |
| 40150.0 | 0.144 |
| 40151.0 | 0.098 |
| 40152.0 | 0.132 |
| 40153.0 | 0.143 |
| 40154.0 | 0.098 |
| 40155.0 | 0.096 |
| 40156.0 | 0.095 |
| 40157.0 | 0.095 |
| 40158.0 | 0.093 |
| 40159.0 | 0.092 |
| 40160.0 | 0.118 |
| 40161.0 | 0.098 |
| 40162.0 | 0.096 |
| 40163.0 | 0.093 |
| 40164.0 | 0.092 |
| 40165.0 | 0.09 |
| 40166.0 | 0.108 |
| 40167.0 | 0.101 |
| 40168.0 | 0.099 |
| 40169.0 | 0.098 |
| 40170.0 | 0.096 |
| 40171.0 | 0.094 |
| 40172.0 | 0.091 |
| 40173.0 | 0.103 |
| 40174.0 | 0.1 |
| 40175.0 | 0.099 |
| 40176.0 | 0.097 |
| 40177.0 | 0.096 |
| 40178.0 | 0.093 |